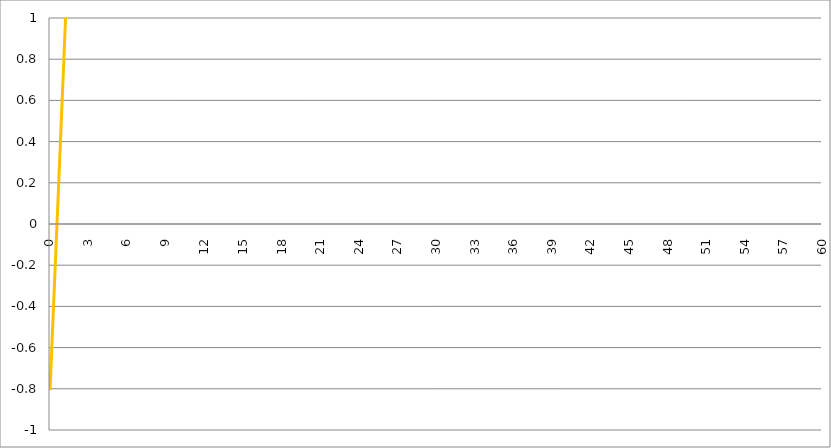
| Category | Series 1 | Series 0 | Series 2 | Series 3 |
|---|---|---|---|---|
| 0.0 |  |  |  | -0.807 |
| 0.03 |  |  |  | -0.763 |
| 0.06 |  |  |  | -0.718 |
| 0.09 |  |  |  | -0.674 |
| 0.12 |  |  |  | -0.629 |
| 0.15 |  |  |  | -0.585 |
| 0.18 |  |  |  | -0.54 |
| 0.21 |  |  |  | -0.496 |
| 0.24 |  |  |  | -0.451 |
| 0.27 |  |  |  | -0.407 |
| 0.3 |  |  |  | -0.362 |
| 0.33 |  |  |  | -0.318 |
| 0.36 |  |  |  | -0.273 |
| 0.39 |  |  |  | -0.229 |
| 0.42 |  |  |  | -0.184 |
| 0.45 |  |  |  | -0.139 |
| 0.48 |  |  |  | -0.095 |
| 0.51 |  |  |  | -0.05 |
| 0.54 |  |  |  | -0.005 |
| 0.57 |  |  |  | 0.039 |
| 0.6 |  |  |  | 0.084 |
| 0.63 |  |  |  | 0.129 |
| 0.66 |  |  |  | 0.174 |
| 0.69 |  |  |  | 0.218 |
| 0.72 |  |  |  | 0.263 |
| 0.75 |  |  |  | 0.308 |
| 0.78 |  |  |  | 0.353 |
| 0.81 |  |  |  | 0.398 |
| 0.84 |  |  |  | 0.443 |
| 0.87 |  |  |  | 0.488 |
| 0.900000000000001 |  |  |  | 0.533 |
| 0.930000000000001 |  |  |  | 0.578 |
| 0.960000000000001 |  |  |  | 0.623 |
| 0.990000000000001 |  |  |  | 0.668 |
| 1.020000000000001 |  |  |  | 0.713 |
| 1.050000000000001 |  |  |  | 0.758 |
| 1.080000000000001 |  |  |  | 0.803 |
| 1.110000000000001 |  |  |  | 0.849 |
| 1.140000000000001 |  |  |  | 0.894 |
| 1.170000000000001 |  |  |  | 0.94 |
| 1.200000000000001 |  |  |  | 0.985 |
| 1.230000000000001 |  |  |  | 1.03 |
| 1.260000000000001 |  |  |  | 1.076 |
| 1.290000000000001 |  |  |  | 1.122 |
| 1.320000000000001 |  |  |  | 1.167 |
| 1.350000000000001 |  |  |  | 1.213 |
| 1.380000000000001 |  |  |  | 1.259 |
| 1.410000000000001 |  |  |  | 1.305 |
| 1.440000000000001 |  |  |  | 1.351 |
| 1.470000000000001 |  |  |  | 1.397 |
| 1.500000000000001 |  |  |  | 1.443 |
| 1.530000000000001 |  |  |  | 1.489 |
| 1.560000000000001 |  |  |  | 1.536 |
| 1.590000000000001 |  |  |  | 1.582 |
| 1.620000000000001 |  |  |  | 1.628 |
| 1.650000000000001 |  |  |  | 1.675 |
| 1.680000000000001 |  |  |  | 1.722 |
| 1.710000000000001 |  |  |  | 1.769 |
| 1.740000000000001 |  |  |  | 1.816 |
| 1.770000000000001 |  |  |  | 1.863 |
| 1.800000000000001 |  |  |  | 1.91 |
| 1.830000000000001 |  |  |  | 1.957 |
| 1.860000000000001 |  |  |  | 2.004 |
| 1.890000000000001 |  |  |  | 2.052 |
| 1.920000000000001 |  |  |  | 2.1 |
| 1.950000000000001 |  |  |  | 2.147 |
| 1.980000000000001 |  |  |  | 2.195 |
| 2.010000000000002 |  |  |  | 2.244 |
| 2.040000000000001 |  |  |  | 2.292 |
| 2.070000000000001 |  |  |  | 2.34 |
| 2.100000000000001 |  |  |  | 2.389 |
| 2.130000000000001 |  |  |  | 2.438 |
| 2.160000000000001 |  |  |  | 2.487 |
| 2.19 |  |  |  | 2.536 |
| 2.22 |  |  |  | 2.585 |
| 2.25 |  |  |  | 2.635 |
| 2.28 |  |  |  | 2.685 |
| 2.31 |  |  |  | 2.735 |
| 2.339999999999999 |  |  |  | 2.785 |
| 2.369999999999999 |  |  |  | 2.835 |
| 2.399999999999999 |  |  |  | 2.886 |
| 2.429999999999999 |  |  |  | 2.937 |
| 2.459999999999999 |  |  |  | 2.988 |
| 2.489999999999998 |  |  |  | 3.04 |
| 2.519999999999998 |  |  |  | 3.091 |
| 2.549999999999998 |  |  |  | 3.144 |
| 2.579999999999998 |  |  |  | 3.196 |
| 2.609999999999998 |  |  |  | 3.249 |
| 2.639999999999997 |  |  |  | 3.302 |
| 2.669999999999997 |  |  |  | 3.355 |
| 2.699999999999997 |  |  |  | 3.408 |
| 2.729999999999997 |  |  |  | 3.462 |
| 2.759999999999997 |  |  |  | 3.517 |
| 2.789999999999996 |  |  |  | 3.572 |
| 2.819999999999996 |  |  |  | 3.627 |
| 2.849999999999996 |  |  |  | 3.682 |
| 2.879999999999996 |  |  |  | 3.738 |
| 2.909999999999996 |  |  |  | 3.794 |
| 2.939999999999995 |  |  |  | 3.851 |
| 2.969999999999995 |  |  |  | 3.908 |
| 2.999999999999995 |  |  |  | 3.966 |
| 3.029999999999995 |  |  |  | 4.024 |
| 3.059999999999995 |  |  |  | 4.083 |
| 3.089999999999995 |  |  |  | 4.142 |
| 3.119999999999994 |  |  |  | 4.202 |
| 3.149999999999994 |  |  |  | 4.262 |
| 3.179999999999994 |  |  |  | 4.323 |
| 3.209999999999994 |  |  |  | 4.385 |
| 3.239999999999994 |  |  |  | 4.447 |
| 3.269999999999993 |  |  |  | 4.509 |
| 3.299999999999993 |  |  |  | 4.573 |
| 3.329999999999993 |  |  |  | 4.637 |
| 3.359999999999993 |  |  |  | 4.701 |
| 3.389999999999993 |  |  |  | 4.767 |
| 3.419999999999992 |  |  |  | 4.833 |
| 3.449999999999992 |  |  |  | 4.899 |
| 3.479999999999992 |  |  |  | 4.967 |
| 3.509999999999992 |  |  |  | 5.036 |
| 3.539999999999992 |  |  |  | 5.105 |
| 3.569999999999991 |  |  |  | 5.175 |
| 3.599999999999991 |  |  |  | 5.246 |
| 3.629999999999991 |  |  |  | 5.318 |
| 3.659999999999991 |  |  |  | 5.39 |
| 3.689999999999991 |  |  |  | 5.464 |
| 3.71999999999999 |  |  |  | 5.539 |
| 3.74999999999999 |  |  |  | 5.615 |
| 3.77999999999999 |  |  |  | 5.691 |
| 3.80999999999999 |  |  |  | 5.769 |
| 3.83999999999999 |  |  |  | 5.848 |
| 3.869999999999989 |  |  |  | 5.929 |
| 3.899999999999989 |  |  |  | 6.01 |
| 3.929999999999989 |  |  |  | 6.092 |
| 3.959999999999989 |  |  |  | 6.176 |
| 3.989999999999989 |  |  |  | 6.261 |
| 4.019999999999989 |  |  |  | 6.348 |
| 4.04999999999999 |  |  |  | 6.436 |
| 4.07999999999999 |  |  |  | 6.525 |
| 4.10999999999999 |  |  |  | 6.616 |
| 4.13999999999999 |  |  |  | 6.708 |
| 4.16999999999999 |  |  |  | 6.802 |
| 4.19999999999999 |  |  |  | 6.897 |
| 4.229999999999991 |  |  |  | 6.994 |
| 4.259999999999991 |  |  |  | 7.093 |
| 4.289999999999991 |  |  |  | 7.193 |
| 4.319999999999991 |  |  |  | 7.296 |
| 4.349999999999992 |  |  |  | 7.4 |
| 4.379999999999992 |  |  |  | 7.506 |
| 4.409999999999992 |  |  |  | 7.614 |
| 4.439999999999992 |  |  |  | 7.724 |
| 4.469999999999993 |  |  |  | 7.836 |
| 4.499999999999993 |  |  |  | 7.95 |
| 4.529999999999993 |  |  |  | 8.067 |
| 4.559999999999993 |  |  |  | 8.186 |
| 4.589999999999994 |  |  |  | 8.307 |
| 4.619999999999994 |  |  |  | 8.43 |
| 4.649999999999994 |  |  |  | 8.556 |
| 4.679999999999994 |  |  |  | 8.685 |
| 4.709999999999994 |  |  |  | 8.816 |
| 4.739999999999994 |  |  |  | 8.95 |
| 4.769999999999995 |  |  |  | 9.087 |
| 4.799999999999995 |  |  |  | 9.226 |
| 4.829999999999996 |  |  |  | 9.369 |
| 4.859999999999996 |  |  |  | 9.514 |
| 4.889999999999996 |  |  |  | 9.663 |
| 4.919999999999996 |  |  |  | 9.815 |
| 4.949999999999996 |  |  |  | 9.97 |
| 4.979999999999996 |  |  |  | 10.129 |
| 5.009999999999997 |  |  |  | 10.291 |
| 5.039999999999997 |  |  |  | 10.457 |
| 5.069999999999998 |  |  |  | 10.627 |
| 5.099999999999998 |  |  |  | 10.8 |
| 5.129999999999998 |  |  |  | 10.977 |
| 5.159999999999998 |  |  |  | 11.159 |
| 5.189999999999999 |  |  |  | 11.344 |
| 5.219999999999999 |  |  |  | 11.534 |
| 5.25 |  |  |  | 11.728 |
| 5.28 |  |  |  | 11.927 |
| 5.31 |  |  |  | 12.131 |
| 5.34 |  |  |  | 12.339 |
| 5.37 |  |  |  | 12.552 |
| 5.4 |  |  |  | 12.771 |
| 5.43 |  |  |  | 12.994 |
| 5.460000000000001 |  |  |  | 13.223 |
| 5.490000000000001 |  |  |  | 13.458 |
| 5.520000000000001 |  |  |  | 13.698 |
| 5.550000000000002 |  |  |  | 13.944 |
| 5.580000000000002 |  |  |  | 14.196 |
| 5.610000000000002 |  |  |  | 14.455 |
| 5.640000000000002 |  |  |  | 14.719 |
| 5.670000000000002 |  |  |  | 14.991 |
| 5.700000000000003 |  |  |  | 15.269 |
| 5.730000000000003 |  |  |  | 15.554 |
| 5.760000000000003 |  |  |  | 15.846 |
| 5.790000000000003 |  |  |  | 16.145 |
| 5.820000000000004 |  |  |  | 16.452 |
| 5.850000000000004 |  |  |  | 16.767 |
| 5.880000000000004 |  |  |  | 17.09 |
| 5.910000000000004 |  |  |  | 17.421 |
| 5.940000000000004 |  |  |  | 17.76 |
| 5.970000000000005 |  |  |  | 18.108 |
| 6.000000000000005 |  |  |  | 18.466 |
| 6.030000000000005 |  |  |  | 18.832 |
| 6.060000000000006 |  |  |  | 19.207 |
| 6.090000000000006 |  |  |  | 19.593 |
| 6.120000000000006 |  |  |  | 19.988 |
| 6.150000000000007 |  |  |  | 20.394 |
| 6.180000000000007 |  |  |  | 20.81 |
| 6.210000000000007 |  |  |  | 21.237 |
| 6.240000000000007 |  |  |  | 21.675 |
| 6.270000000000007 |  |  |  | 22.125 |
| 6.300000000000008 |  |  |  | 22.586 |
| 6.330000000000008 |  |  |  | 23.06 |
| 6.360000000000008 |  |  |  | 23.546 |
| 6.390000000000008 |  |  |  | 24.045 |
| 6.420000000000009 |  |  |  | 24.556 |
| 6.45000000000001 |  |  |  | 25.082 |
| 6.48000000000001 |  |  |  | 25.621 |
| 6.51000000000001 |  |  |  | 26.175 |
| 6.54000000000001 |  |  |  | 26.743 |
| 6.57000000000001 |  |  |  | 27.327 |
| 6.60000000000001 |  |  |  | 27.926 |
| 6.63000000000001 |  |  |  | 28.541 |
| 6.660000000000011 |  |  |  | 29.172 |
| 6.690000000000011 |  |  |  | 29.82 |
| 6.720000000000011 |  |  |  | 30.485 |
| 6.750000000000011 |  |  |  | 31.169 |
| 6.780000000000012 |  |  |  | 31.87 |
| 6.810000000000012 |  |  |  | 32.591 |
| 6.840000000000012 |  |  |  | 33.33 |
| 6.870000000000012 |  |  |  | 34.09 |
| 6.900000000000013 |  |  |  | 34.87 |
| 6.930000000000013 |  |  |  | 35.67 |
| 6.960000000000013 |  |  |  | 36.493 |
| 6.990000000000013 |  |  |  | 37.337 |
| 7.020000000000014 |  |  |  | 38.204 |
| 7.050000000000014 |  |  |  | 39.095 |
| 7.080000000000014 |  |  |  | 40.01 |
| 7.110000000000015 |  |  |  | 40.949 |
| 7.140000000000015 |  |  |  | 41.914 |
| 7.170000000000015 |  |  |  | 42.904 |
| 7.200000000000015 |  |  |  | 43.922 |
| 7.230000000000015 |  |  |  | 44.967 |
| 7.260000000000016 |  |  |  | 46.04 |
| 7.290000000000016 |  |  |  | 47.142 |
| 7.320000000000016 |  |  |  | 48.274 |
| 7.350000000000016 |  |  |  | 49.437 |
| 7.380000000000017 |  |  |  | 50.631 |
| 7.410000000000017 |  |  |  | 51.858 |
| 7.440000000000017 |  |  |  | 53.117 |
| 7.470000000000017 |  |  |  | 54.411 |
| 7.500000000000018 |  |  |  | 55.74 |
| 7.530000000000018 |  |  |  | 57.105 |
| 7.560000000000018 |  |  |  | 58.507 |
| 7.590000000000018 |  |  |  | 59.947 |
| 7.620000000000019 |  |  |  | 61.426 |
| 7.650000000000019 |  |  |  | 62.945 |
| 7.680000000000019 |  |  |  | 64.505 |
| 7.710000000000019 |  |  |  | 66.108 |
| 7.74000000000002 |  |  |  | 67.754 |
| 7.77000000000002 |  |  |  | 69.445 |
| 7.80000000000002 |  |  |  | 71.181 |
| 7.83000000000002 |  |  |  | 72.965 |
| 7.860000000000021 |  |  |  | 74.797 |
| 7.890000000000021 |  |  |  | 76.679 |
| 7.920000000000021 |  |  |  | 78.612 |
| 7.950000000000021 |  |  |  | 80.597 |
| 7.980000000000021 |  |  |  | 82.636 |
| 8.010000000000021 |  |  |  | 84.731 |
| 8.04000000000002 |  |  |  | 86.882 |
| 8.07000000000002 |  |  |  | 89.092 |
| 8.10000000000002 |  |  |  | 91.362 |
| 8.130000000000019 |  |  |  | 93.693 |
| 8.160000000000016 |  |  |  | 96.087 |
| 8.190000000000017 |  |  |  | 98.546 |
| 8.220000000000017 |  |  |  | 101.072 |
| 8.250000000000014 |  |  |  | 103.667 |
| 8.280000000000015 |  |  |  | 106.331 |
| 8.310000000000015 |  |  |  | 109.068 |
| 8.340000000000014 |  |  |  | 111.879 |
| 8.370000000000013 |  |  |  | 114.767 |
| 8.400000000000013 |  |  |  | 117.732 |
| 8.430000000000012 |  |  |  | 120.778 |
| 8.46000000000001 |  |  |  | 123.906 |
| 8.49000000000001 |  |  |  | 127.119 |
| 8.52000000000001 |  |  |  | 130.418 |
| 8.55000000000001 |  |  |  | 133.807 |
| 8.580000000000007 |  |  |  | 137.288 |
| 8.610000000000008 |  |  |  | 140.863 |
| 8.640000000000008 |  |  |  | 144.535 |
| 8.670000000000007 |  |  |  | 148.305 |
| 8.700000000000006 |  |  |  | 152.178 |
| 8.730000000000006 |  |  |  | 156.155 |
| 8.760000000000005 |  |  |  | 160.24 |
| 8.790000000000004 |  |  |  | 164.435 |
| 8.820000000000004 |  |  |  | 168.744 |
| 8.850000000000003 |  |  |  | 173.168 |
| 8.880000000000003 |  |  |  | 177.712 |
| 8.91 |  |  |  | 182.379 |
| 8.940000000000001 |  |  |  | 187.172 |
| 8.97 |  |  |  | 192.093 |
| 9.0 |  |  |  | 197.148 |
| 9.03 |  |  |  | 202.338 |
| 9.059999999999999 |  |  |  | 207.669 |
| 9.089999999999998 |  |  |  | 213.143 |
| 9.119999999999997 |  |  |  | 218.765 |
| 9.149999999999997 |  |  |  | 224.537 |
| 9.179999999999996 |  |  |  | 230.466 |
| 9.209999999999996 |  |  |  | 236.553 |
| 9.239999999999995 |  |  |  | 242.805 |
| 9.269999999999994 |  |  |  | 249.224 |
| 9.299999999999994 |  |  |  | 255.816 |
| 9.32999999999999 |  |  |  | 262.585 |
| 9.35999999999999 |  |  |  | 269.536 |
| 9.38999999999999 |  |  |  | 276.674 |
| 9.41999999999999 |  |  |  | 284.003 |
| 9.44999999999999 |  |  |  | 291.53 |
| 9.47999999999999 |  |  |  | 299.258 |
| 9.50999999999999 |  |  |  | 307.193 |
| 9.539999999999988 |  |  |  | 315.341 |
| 9.569999999999988 |  |  |  | 323.707 |
| 9.599999999999987 |  |  |  | 332.298 |
| 9.629999999999987 |  |  |  | 341.119 |
| 9.659999999999984 |  |  |  | 350.176 |
| 9.689999999999985 |  |  |  | 359.476 |
| 9.719999999999985 |  |  |  | 369.024 |
| 9.749999999999982 |  |  |  | 378.828 |
| 9.779999999999983 |  |  |  | 388.894 |
| 9.80999999999998 |  |  |  | 399.229 |
| 9.83999999999998 |  |  |  | 409.841 |
| 9.86999999999998 |  |  |  | 420.736 |
| 9.89999999999998 |  |  |  | 431.922 |
| 9.92999999999998 |  |  |  | 443.407 |
| 9.95999999999998 |  |  |  | 455.199 |
| 9.989999999999977 |  |  |  | 467.305 |
| 10.01999999999998 |  |  |  | 479.734 |
| 10.04999999999998 |  |  |  | 492.495 |
| 10.07999999999998 |  |  |  | 505.596 |
| 10.10999999999998 |  |  |  | 519.046 |
| 10.13999999999998 |  |  |  | 532.855 |
| 10.16999999999998 |  |  |  | 547.031 |
| 10.19999999999997 |  |  |  | 561.585 |
| 10.22999999999997 |  |  |  | 576.526 |
| 10.25999999999997 |  |  |  | 591.865 |
| 10.28999999999997 |  |  |  | 607.612 |
| 10.31999999999997 |  |  |  | 623.778 |
| 10.34999999999997 |  |  |  | 640.373 |
| 10.37999999999997 |  |  |  | 657.41 |
| 10.40999999999997 |  |  |  | 674.899 |
| 10.43999999999997 |  |  |  | 692.853 |
| 10.46999999999997 |  |  |  | 711.284 |
| 10.49999999999997 |  |  |  | 730.203 |
| 10.52999999999997 |  |  |  | 749.625 |
| 10.55999999999997 |  |  |  | 769.562 |
| 10.58999999999997 |  |  |  | 790.028 |
| 10.61999999999997 |  |  |  | 811.037 |
| 10.64999999999996 |  |  |  | 832.602 |
| 10.67999999999996 |  |  |  | 854.738 |
| 10.70999999999996 |  |  |  | 877.461 |
| 10.73999999999996 |  |  |  | 900.786 |
| 10.76999999999996 |  |  |  | 924.728 |
| 10.79999999999996 |  |  |  | 949.303 |
| 10.82999999999996 |  |  |  | 974.529 |
| 10.85999999999996 |  |  |  | 1000.422 |
| 10.88999999999996 |  |  |  | 1026.999 |
| 10.91999999999996 |  |  |  | 1054.279 |
| 10.94999999999996 |  |  |  | 1082.279 |
| 10.97999999999996 |  |  |  | 1111.019 |
| 11.00999999999996 |  |  |  | 1140.519 |
| 11.03999999999996 |  |  |  | 1170.796 |
| 11.06999999999996 |  |  |  | 1201.873 |
| 11.09999999999996 |  |  |  | 1233.77 |
| 11.12999999999995 |  |  |  | 1266.508 |
| 11.15999999999995 |  |  |  | 1300.109 |
| 11.18999999999995 |  |  |  | 1334.596 |
| 11.21999999999995 |  |  |  | 1369.991 |
| 11.24999999999995 |  |  |  | 1406.319 |
| 11.27999999999995 |  |  |  | 1443.604 |
| 11.30999999999995 |  |  |  | 1481.87 |
| 11.33999999999995 |  |  |  | 1521.144 |
| 11.36999999999995 |  |  |  | 1561.451 |
| 11.39999999999995 |  |  |  | 1602.818 |
| 11.42999999999995 |  |  |  | 1645.273 |
| 11.45999999999995 |  |  |  | 1688.844 |
| 11.48999999999995 |  |  |  | 1733.56 |
| 11.51999999999995 |  |  |  | 1779.451 |
| 11.54999999999995 |  |  |  | 1826.547 |
| 11.57999999999994 |  |  |  | 1874.88 |
| 11.60999999999994 |  |  |  | 1924.482 |
| 11.63999999999994 |  |  |  | 1975.386 |
| 11.66999999999994 |  |  |  | 2027.625 |
| 11.69999999999994 |  |  |  | 2081.235 |
| 11.72999999999994 |  |  |  | 2136.25 |
| 11.75999999999994 |  |  |  | 2192.707 |
| 11.78999999999994 |  |  |  | 2250.644 |
| 11.81999999999994 |  |  |  | 2310.099 |
| 11.84999999999994 |  |  |  | 2371.112 |
| 11.87999999999994 |  |  |  | 2433.722 |
| 11.90999999999994 |  |  |  | 2497.971 |
| 11.93999999999994 |  |  |  | 2563.901 |
| 11.96999999999994 |  |  |  | 2631.557 |
| 11.99999999999994 |  |  |  | 2700.982 |
| 12.02999999999994 |  |  |  | 2772.223 |
| 12.05999999999993 |  |  |  | 2845.326 |
| 12.08999999999993 |  |  |  | 2920.34 |
| 12.11999999999993 |  |  |  | 2997.314 |
| 12.14999999999993 |  |  |  | 3076.299 |
| 12.17999999999993 |  |  |  | 3157.346 |
| 12.20999999999993 |  |  |  | 3240.51 |
| 12.23999999999993 |  |  |  | 3325.844 |
| 12.26999999999993 |  |  |  | 3413.405 |
| 12.29999999999993 |  |  |  | 3503.251 |
| 12.32999999999993 |  |  |  | 3595.439 |
| 12.35999999999993 |  |  |  | 3690.032 |
| 12.38999999999993 |  |  |  | 3787.09 |
| 12.41999999999993 |  |  |  | 3886.678 |
| 12.44999999999993 |  |  |  | 3988.86 |
| 12.47999999999993 |  |  |  | 4093.705 |
| 12.50999999999993 |  |  |  | 4201.279 |
| 12.53999999999992 |  |  |  | 4311.654 |
| 12.56999999999992 |  |  |  | 4424.902 |
| 12.59999999999992 |  |  |  | 4541.097 |
| 12.62999999999992 |  |  |  | 4660.315 |
| 12.65999999999992 |  |  |  | 4782.634 |
| 12.68999999999992 |  |  |  | 4908.133 |
| 12.71999999999992 |  |  |  | 5036.895 |
| 12.74999999999992 |  |  |  | 5169.003 |
| 12.77999999999992 |  |  |  | 5304.543 |
| 12.80999999999992 |  |  |  | 5443.605 |
| 12.83999999999992 |  |  |  | 5586.278 |
| 12.86999999999992 |  |  |  | 5732.656 |
| 12.89999999999992 |  |  |  | 5882.833 |
| 12.92999999999992 |  |  |  | 6036.908 |
| 12.95999999999992 |  |  |  | 6194.981 |
| 12.98999999999991 |  |  |  | 6357.153 |
| 13.01999999999991 |  |  |  | 6523.532 |
| 13.04999999999991 |  |  |  | 6694.224 |
| 13.07999999999991 |  |  |  | 6869.341 |
| 13.10999999999991 |  |  |  | 7048.996 |
| 13.13999999999991 |  |  |  | 7233.306 |
| 13.16999999999991 |  |  |  | 7422.39 |
| 13.19999999999991 |  |  |  | 7616.371 |
| 13.22999999999991 |  |  |  | 7815.374 |
| 13.25999999999991 |  |  |  | 8019.529 |
| 13.28999999999991 |  |  |  | 8228.967 |
| 13.31999999999991 |  |  |  | 8443.824 |
| 13.34999999999991 |  |  |  | 8664.238 |
| 13.37999999999991 |  |  |  | 8890.354 |
| 13.40999999999991 |  |  |  | 9122.315 |
| 13.43999999999991 |  |  |  | 9360.273 |
| 13.4699999999999 |  |  |  | 9604.381 |
| 13.4999999999999 |  |  |  | 9854.797 |
| 13.5299999999999 |  |  |  | 10111.682 |
| 13.5599999999999 |  |  |  | 10375.201 |
| 13.5899999999999 |  |  |  | 10645.525 |
| 13.6199999999999 |  |  |  | 10922.828 |
| 13.6499999999999 |  |  |  | 11207.288 |
| 13.6799999999999 |  |  |  | 11499.088 |
| 13.7099999999999 |  |  |  | 11798.417 |
| 13.7399999999999 |  |  |  | 12105.467 |
| 13.7699999999999 |  |  |  | 12420.436 |
| 13.7999999999999 |  |  |  | 12743.525 |
| 13.8299999999999 |  |  |  | 13074.943 |
| 13.8599999999999 |  |  |  | 13414.902 |
| 13.8899999999999 |  |  |  | 13763.621 |
| 13.9199999999999 |  |  |  | 14121.323 |
| 13.94999999999989 |  |  |  | 14488.239 |
| 13.97999999999989 |  |  |  | 14864.602 |
| 14.00999999999989 |  |  |  | 15250.656 |
| 14.03999999999989 |  |  |  | 15646.646 |
| 14.0699999999999 |  |  |  | 16052.827 |
| 14.0999999999999 |  |  |  | 16469.459 |
| 14.1299999999999 |  |  |  | 16896.809 |
| 14.15999999999989 |  |  |  | 17335.15 |
| 14.18999999999989 |  |  |  | 17784.762 |
| 14.21999999999989 |  |  |  | 18245.934 |
| 14.24999999999989 |  |  |  | 18718.959 |
| 14.27999999999989 |  |  |  | 19204.14 |
| 14.30999999999989 |  |  |  | 19701.787 |
| 14.33999999999989 |  |  |  | 20212.218 |
| 14.36999999999989 |  |  |  | 20735.759 |
| 14.39999999999988 |  |  |  | 21272.743 |
| 14.42999999999988 |  |  |  | 21823.514 |
| 14.45999999999988 |  |  |  | 22388.422 |
| 14.48999999999988 |  |  |  | 22967.827 |
| 14.51999999999988 |  |  |  | 23562.099 |
| 14.54999999999988 |  |  |  | 24171.616 |
| 14.57999999999988 |  |  |  | 24796.766 |
| 14.60999999999988 |  |  |  | 25437.948 |
| 14.63999999999988 |  |  |  | 26095.569 |
| 14.66999999999988 |  |  |  | 26770.047 |
| 14.69999999999988 |  |  |  | 27461.811 |
| 14.72999999999988 |  |  |  | 28171.301 |
| 14.75999999999988 |  |  |  | 28898.969 |
| 14.78999999999988 |  |  |  | 29645.275 |
| 14.81999999999988 |  |  |  | 30410.694 |
| 14.84999999999988 |  |  |  | 31195.713 |
| 14.87999999999987 |  |  |  | 32000.828 |
| 14.90999999999987 |  |  |  | 32826.551 |
| 14.93999999999987 |  |  |  | 33673.405 |
| 14.96999999999987 |  |  |  | 34541.927 |
| 14.99999999999987 |  |  |  | 35432.668 |
| 15.02999999999987 |  |  |  | 36346.191 |
| 15.05999999999987 |  |  |  | 37283.076 |
| 15.08999999999987 |  |  |  | 38243.916 |
| 15.11999999999987 |  |  |  | 39229.318 |
| 15.14999999999987 |  |  |  | 40239.906 |
| 15.17999999999987 |  |  |  | 41276.319 |
| 15.20999999999987 |  |  |  | 42339.213 |
| 15.23999999999987 |  |  |  | 43429.259 |
| 15.26999999999987 |  |  |  | 44547.146 |
| 15.29999999999987 |  |  |  | 45693.581 |
| 15.32999999999987 |  |  |  | 46869.286 |
| 15.35999999999986 |  |  |  | 48075.005 |
| 15.38999999999986 |  |  |  | 49311.498 |
| 15.41999999999986 |  |  |  | 50579.545 |
| 15.44999999999986 |  |  |  | 51879.946 |
| 15.47999999999986 |  |  |  | 53213.521 |
| 15.50999999999986 |  |  |  | 54581.11 |
| 15.53999999999986 |  |  |  | 55983.575 |
| 15.56999999999986 |  |  |  | 57421.8 |
| 15.59999999999986 |  |  |  | 58896.69 |
| 15.62999999999986 |  |  |  | 60409.173 |
| 15.65999999999986 |  |  |  | 61960.201 |
| 15.68999999999986 |  |  |  | 63550.751 |
| 15.71999999999986 |  |  |  | 65181.822 |
| 15.74999999999986 |  |  |  | 66854.44 |
| 15.77999999999986 |  |  |  | 68569.656 |
| 15.80999999999985 |  |  |  | 70328.548 |
| 15.83999999999985 |  |  |  | 72132.221 |
| 15.86999999999985 |  |  |  | 73981.807 |
| 15.89999999999985 |  |  |  | 75878.469 |
| 15.92999999999985 |  |  |  | 77823.395 |
| 15.95999999999985 |  |  |  | 79817.807 |
| 15.98999999999985 |  |  |  | 81862.955 |
| 16.01999999999985 |  |  |  | 83960.122 |
| 16.04999999999985 |  |  |  | 86110.623 |
| 16.07999999999985 |  |  |  | 88315.804 |
| 16.10999999999985 |  |  |  | 90577.049 |
| 16.13999999999985 |  |  |  | 92895.773 |
| 16.16999999999986 |  |  |  | 95273.427 |
| 16.19999999999986 |  |  |  | 97711.501 |
| 16.22999999999986 |  |  |  | 100211.52 |
| 16.25999999999986 |  |  |  | 102775.049 |
| 16.28999999999986 |  |  |  | 105403.689 |
| 16.31999999999986 |  |  |  | 108099.086 |
| 16.34999999999986 |  |  |  | 110862.924 |
| 16.37999999999986 |  |  |  | 113696.931 |
| 16.40999999999987 |  |  |  | 116602.876 |
| 16.43999999999987 |  |  |  | 119582.574 |
| 16.46999999999987 |  |  |  | 122637.887 |
| 16.49999999999987 |  |  |  | 125770.722 |
| 16.52999999999987 |  |  |  | 128983.033 |
| 16.55999999999987 |  |  |  | 132276.824 |
| 16.58999999999987 |  |  |  | 135654.151 |
| 16.61999999999987 |  |  |  | 139117.119 |
| 16.64999999999987 |  |  |  | 142667.887 |
| 16.67999999999988 |  |  |  | 146308.667 |
| 16.70999999999988 |  |  |  | 150041.728 |
| 16.73999999999988 |  |  |  | 153869.396 |
| 16.76999999999988 |  |  |  | 157794.053 |
| 16.79999999999988 |  |  |  | 161818.144 |
| 16.82999999999988 |  |  |  | 165944.172 |
| 16.85999999999988 |  |  |  | 170174.705 |
| 16.88999999999988 |  |  |  | 174512.374 |
| 16.91999999999988 |  |  |  | 178959.878 |
| 16.94999999999989 |  |  |  | 183519.981 |
| 16.97999999999989 |  |  |  | 188195.517 |
| 17.00999999999989 |  |  |  | 192989.393 |
| 17.03999999999989 |  |  |  | 197904.585 |
| 17.06999999999989 |  |  |  | 202944.148 |
| 17.09999999999989 |  |  |  | 208111.21 |
| 17.12999999999989 |  |  |  | 213408.978 |
| 17.15999999999989 |  |  |  | 218840.742 |
| 17.18999999999989 |  |  |  | 224409.869 |
| 17.2199999999999 |  |  |  | 230119.816 |
| 17.2499999999999 |  |  |  | 235974.123 |
| 17.2799999999999 |  |  |  | 241976.42 |
| 17.3099999999999 |  |  |  | 248130.427 |
| 17.3399999999999 |  |  |  | 254439.957 |
| 17.3699999999999 |  |  |  | 260908.92 |
| 17.3999999999999 |  |  |  | 267541.321 |
| 17.4299999999999 |  |  |  | 274341.269 |
| 17.4599999999999 |  |  |  | 281312.972 |
| 17.48999999999991 |  |  |  | 288460.745 |
| 17.51999999999991 |  |  |  | 295789.012 |
| 17.54999999999991 |  |  |  | 303302.304 |
| 17.57999999999991 |  |  |  | 311005.269 |
| 17.60999999999991 |  |  |  | 318902.67 |
| 17.63999999999991 |  |  |  | 326999.389 |
| 17.66999999999991 |  |  |  | 335300.428 |
| 17.69999999999991 |  |  |  | 343810.918 |
| 17.72999999999992 |  |  |  | 352536.115 |
| 17.75999999999992 |  |  |  | 361481.407 |
| 17.78999999999992 |  |  |  | 370652.318 |
| 17.81999999999992 |  |  |  | 380054.507 |
| 17.84999999999992 |  |  |  | 389693.779 |
| 17.87999999999992 |  |  |  | 399576.079 |
| 17.90999999999992 |  |  |  | 409707.504 |
| 17.93999999999992 |  |  |  | 420094.301 |
| 17.96999999999992 |  |  |  | 430742.875 |
| 17.99999999999993 |  |  |  | 441659.789 |
| 18.02999999999993 |  |  |  | 452851.77 |
| 18.05999999999993 |  |  |  | 464325.715 |
| 18.08999999999993 |  |  |  | 476088.692 |
| 18.11999999999993 |  |  |  | 488147.943 |
| 18.14999999999993 |  |  |  | 500510.894 |
| 18.17999999999993 |  |  |  | 513185.155 |
| 18.20999999999993 |  |  |  | 526178.527 |
| 18.23999999999993 |  |  |  | 539499.002 |
| 18.26999999999994 |  |  |  | 553154.776 |
| 18.29999999999994 |  |  |  | 567154.246 |
| 18.32999999999994 |  |  |  | 581506.021 |
| 18.35999999999994 |  |  |  | 596218.922 |
| 18.38999999999994 |  |  |  | 611301.993 |
| 18.41999999999994 |  |  |  | 626764.5 |
| 18.44999999999994 |  |  |  | 642615.943 |
| 18.47999999999994 |  |  |  | 658866.057 |
| 18.50999999999994 |  |  |  | 675524.82 |
| 18.53999999999995 |  |  |  | 692602.46 |
| 18.56999999999995 |  |  |  | 710109.458 |
| 18.59999999999995 |  |  |  | 728056.558 |
| 18.62999999999995 |  |  |  | 746454.769 |
| 18.65999999999995 |  |  |  | 765315.378 |
| 18.68999999999995 |  |  |  | 784649.95 |
| 18.71999999999995 |  |  |  | 804470.339 |
| 18.74999999999995 |  |  |  | 824788.695 |
| 18.77999999999995 |  |  |  | 845617.47 |
| 18.80999999999996 |  |  |  | 866969.426 |
| 18.83999999999996 |  |  |  | 888857.643 |
| 18.86999999999996 |  |  |  | 911295.527 |
| 18.89999999999996 |  |  |  | 934296.818 |
| 18.92999999999996 |  |  |  | 957875.595 |
| 18.95999999999996 |  |  |  | 982046.293 |
| 18.98999999999996 |  |  |  | 1006823.701 |
| 19.01999999999996 |  |  |  | 1032222.979 |
| 19.04999999999997 |  |  |  | 1058259.663 |
| 19.07999999999997 |  |  |  | 1084949.677 |
| 19.10999999999997 |  |  |  | 1112309.34 |
| 19.13999999999997 |  |  |  | 1140355.376 |
| 19.16999999999997 |  |  |  | 1169104.929 |
| 19.19999999999997 |  |  |  | 1198575.564 |
| 19.22999999999997 |  |  |  | 1228785.287 |
| 19.25999999999997 |  |  |  | 1259752.551 |
| 19.28999999999997 |  |  |  | 1291496.267 |
| 19.31999999999998 |  |  |  | 1324035.816 |
| 19.34999999999998 |  |  |  | 1357391.061 |
| 19.37999999999998 |  |  |  | 1391582.362 |
| 19.40999999999998 |  |  |  | 1426630.58 |
| 19.43999999999998 |  |  |  | 1462557.097 |
| 19.46999999999998 |  |  |  | 1499383.829 |
| 19.49999999999998 |  |  |  | 1537133.232 |
| 19.52999999999998 |  |  |  | 1575828.323 |
| 19.55999999999998 |  |  |  | 1615492.69 |
| 19.58999999999999 |  |  |  | 1656150.508 |
| 19.61999999999999 |  |  |  | 1697826.552 |
| 19.64999999999999 |  |  |  | 1740546.212 |
| 19.67999999999999 |  |  |  | 1784335.51 |
| 19.70999999999999 |  |  |  | 1829221.112 |
| 19.73999999999999 |  |  |  | 1875230.35 |
| 19.76999999999999 |  |  |  | 1922391.231 |
| 19.79999999999999 |  |  |  | 1970732.461 |
| 19.82999999999999 |  |  |  | 2020283.455 |
| 19.86 |  |  |  | 2071074.363 |
| 19.89 |  |  |  | 2123136.078 |
| 19.92 |  |  |  | 2176500.266 |
| 19.95 |  |  |  | 2231199.373 |
| 19.98 |  |  |  | 2287266.656 |
| 20.01 |  |  |  | 2344736.193 |
| 20.04 |  |  |  | 2403642.91 |
| 20.07 |  |  |  | 2464022.599 |
| 20.1 |  |  |  | 2525911.941 |
| 20.13000000000001 |  |  |  | 2589348.526 |
| 20.16000000000001 |  |  |  | 2654370.877 |
| 20.19000000000001 |  |  |  | 2721018.472 |
| 20.22000000000001 |  |  |  | 2789331.771 |
| 20.25000000000001 |  |  |  | 2859352.234 |
| 20.28000000000001 |  |  |  | 2931122.352 |
| 20.31000000000001 |  |  |  | 3004685.667 |
| 20.34000000000001 |  |  |  | 3080086.804 |
| 20.37000000000002 |  |  |  | 3157371.492 |
| 20.40000000000002 |  |  |  | 3236586.595 |
| 20.43000000000002 |  |  |  | 3317780.14 |
| 20.46000000000002 |  |  |  | 3401001.341 |
| 20.49000000000002 |  |  |  | 3486300.636 |
| 20.52000000000002 |  |  |  | 3573729.711 |
| 20.55000000000002 |  |  |  | 3663341.533 |
| 20.58000000000002 |  |  |  | 3755190.383 |
| 20.61000000000002 |  |  |  | 3849331.886 |
| 20.64000000000003 |  |  |  | 3945823.045 |
| 20.67000000000003 |  |  |  | 4044722.277 |
| 20.70000000000003 |  |  |  | 4146089.446 |
| 20.73000000000003 |  |  |  | 4249985.897 |
| 20.76000000000003 |  |  |  | 4356474.497 |
| 20.79000000000003 |  |  |  | 4465619.668 |
| 20.82000000000003 |  |  |  | 4577487.431 |
| 20.85000000000003 |  |  |  | 4692145.44 |
| 20.88000000000003 |  |  |  | 4809663.023 |
| 20.91000000000004 |  |  |  | 4930111.227 |
| 20.94000000000004 |  |  |  | 5053562.858 |
| 20.97000000000004 |  |  |  | 5180092.523 |
| 21.00000000000004 |  |  |  | 5309776.678 |
| 21.03000000000004 |  |  |  | 5442693.672 |
| 21.06000000000004 |  |  |  | 5578923.79 |
| 21.09000000000004 |  |  |  | 5718549.308 |
| 21.12000000000004 |  |  |  | 5861654.538 |
| 21.15000000000004 |  |  |  | 6008325.875 |
| 21.18000000000005 |  |  |  | 6158651.857 |
| 21.21000000000005 |  |  |  | 6312723.209 |
| 21.24000000000005 |  |  |  | 6470632.903 |
| 21.27000000000005 |  |  |  | 6632476.21 |
| 21.30000000000005 |  |  |  | 6798350.759 |
| 21.33000000000005 |  |  |  | 6968356.593 |
| 21.36000000000005 |  |  |  | 7142596.232 |
| 21.39000000000005 |  |  |  | 7321174.728 |
| 21.42000000000005 |  |  |  | 7504199.735 |
| 21.45000000000006 |  |  |  | 7691781.568 |
| 21.48000000000006 |  |  |  | 7884033.268 |
| 21.51000000000006 |  |  |  | 8081070.675 |
| 21.54000000000006 |  |  |  | 8283012.49 |
| 21.57000000000006 |  |  |  | 8489980.35 |
| 21.60000000000006 |  |  |  | 8702098.901 |
| 21.63000000000006 |  |  |  | 8919495.867 |
| 21.66000000000006 |  |  |  | 9142302.131 |
| 21.69000000000007 |  |  |  | 9370651.811 |
| 21.72000000000007 |  |  |  | 9604682.34 |
| 21.75000000000007 |  |  |  | 9844534.547 |
| 21.78000000000007 |  |  |  | 10090352.742 |
| 21.81000000000007 |  |  |  | 10342284.8 |
| 21.84000000000007 |  |  |  | 10600482.25 |
| 21.87000000000007 |  |  |  | 10865100.365 |
| 21.90000000000007 |  |  |  | 11136298.256 |
| 21.93000000000007 |  |  |  | 11414238.961 |
| 21.96000000000008 |  |  |  | 11699089.548 |
| 21.99000000000008 |  |  |  | 11991021.211 |
| 22.02000000000008 |  |  |  | 12290209.373 |
| 22.05000000000008 |  |  |  | 12596833.789 |
| 22.08000000000008 |  |  |  | 12911078.652 |
| 22.11000000000008 |  |  |  | 13233132.705 |
| 22.14000000000008 |  |  |  | 13563189.351 |
| 22.17000000000008 |  |  |  | 13901446.768 |
| 22.20000000000008 |  |  |  | 14248108.028 |
| 22.23000000000009 |  |  |  | 14603381.216 |
| 22.26000000000009 |  |  |  | 14967479.552 |
| 22.29000000000009 |  |  |  | 15340621.521 |
| 22.32000000000009 |  |  |  | 15723031 |
| 22.3500000000001 |  |  |  | 16114937.394 |
| 22.38000000000009 |  |  |  | 16516575.765 |
| 22.41000000000009 |  |  |  | 16928186.979 |
| 22.44000000000009 |  |  |  | 17350017.846 |
| 22.47000000000009 |  |  |  | 17782321.264 |
| 22.5000000000001 |  |  |  | 18225356.373 |
| 22.5300000000001 |  |  |  | 18679388.704 |
| 22.5600000000001 |  |  |  | 19144690.341 |
| 22.5900000000001 |  |  |  | 19621540.078 |
| 22.6200000000001 |  |  |  | 20110223.587 |
| 22.6500000000001 |  |  |  | 20611033.586 |
| 22.6800000000001 |  |  |  | 21124270.013 |
| 22.7100000000001 |  |  |  | 21650240.203 |
| 22.7400000000001 |  |  |  | 22189259.068 |
| 22.77000000000011 |  |  |  | 22741649.289 |
| 22.80000000000011 |  |  |  | 23307741.501 |
| 22.83000000000011 |  |  |  | 23887874.492 |
| 22.86000000000011 |  |  |  | 24482395.403 |
| 22.89000000000011 |  |  |  | 25091659.931 |
| 22.92000000000011 |  |  |  | 25716032.545 |
| 22.95000000000011 |  |  |  | 26355886.695 |
| 22.98000000000011 |  |  |  | 27011605.038 |
| 23.01000000000012 |  |  |  | 27683579.66 |
| 23.04000000000012 |  |  |  | 28372212.313 |
| 23.07000000000012 |  |  |  | 29077914.647 |
| 23.10000000000012 |  |  |  | 29801108.458 |
| 23.13000000000012 |  |  |  | 30542225.935 |
| 23.16000000000012 |  |  |  | 31301709.915 |
| 23.19000000000012 |  |  |  | 32080014.145 |
| 23.22000000000012 |  |  |  | 32877603.554 |
| 23.25000000000012 |  |  |  | 33694954.52 |
| 23.28000000000013 |  |  |  | 34532555.159 |
| 23.31000000000013 |  |  |  | 35390905.609 |
| 23.34000000000013 |  |  |  | 36270518.326 |
| 23.37000000000013 |  |  |  | 37171918.39 |
| 23.40000000000013 |  |  |  | 38095643.808 |
| 23.43000000000013 |  |  |  | 39042245.84 |
| 23.46000000000013 |  |  |  | 40012289.318 |
| 23.49000000000013 |  |  |  | 41006352.984 |
| 23.52000000000013 |  |  |  | 42025029.826 |
| 23.55000000000014 |  |  |  | 43068927.436 |
| 23.58000000000014 |  |  |  | 44138668.362 |
| 23.61000000000014 |  |  |  | 45234890.475 |
| 23.64000000000014 |  |  |  | 46358247.352 |
| 23.67000000000014 |  |  |  | 47509408.655 |
| 23.70000000000014 |  |  |  | 48689060.528 |
| 23.73000000000014 |  |  |  | 49897906.004 |
| 23.76000000000014 |  |  |  | 51136665.416 |
| 23.79000000000014 |  |  |  | 52406076.823 |
| 23.82000000000015 |  |  |  | 53706896.448 |
| 23.85000000000015 |  |  |  | 55039899.119 |
| 23.88000000000015 |  |  |  | 56405878.73 |
| 23.91000000000015 |  |  |  | 57805648.705 |
| 23.94000000000015 |  |  |  | 59240042.481 |
| 23.97000000000015 |  |  |  | 60709913.999 |
| 24.00000000000015 |  |  |  | 62216138.202 |
| 24.03000000000015 |  |  |  | 63759611.558 |
| 24.06000000000016 |  |  |  | 65341252.583 |
| 24.09000000000016 |  |  |  | 66962002.384 |
| 24.12000000000016 |  |  |  | 68622825.211 |
| 24.15000000000016 |  |  |  | 70324709.029 |
| 24.18000000000016 |  |  |  | 72068666.096 |
| 24.21000000000016 |  |  |  | 73855733.561 |
| 24.24000000000016 |  |  |  | 75686974.074 |
| 24.27000000000016 |  |  |  | 77563476.412 |
| 24.30000000000016 |  |  |  | 79486356.118 |
| 24.33000000000017 |  |  |  | 81456756.16 |
| 24.36000000000017 |  |  |  | 83475847.604 |
| 24.39000000000017 |  |  |  | 85544830.299 |
| 24.42000000000017 |  |  |  | 87664933.587 |
| 24.45000000000017 |  |  |  | 89837417.024 |
| 24.48000000000017 |  |  |  | 92063571.125 |
| 24.51000000000017 |  |  |  | 94344718.115 |
| 24.54000000000017 |  |  |  | 96682212.715 |
| 24.57000000000017 |  |  |  | 99077442.934 |
| 24.60000000000018 |  |  |  | 101531830.886 |
| 24.63000000000018 |  |  |  | 104046833.627 |
| 24.66000000000018 |  |  |  | 106623944.01 |
| 24.69000000000018 |  |  |  | 109264691.564 |
| 24.72000000000018 |  |  |  | 111970643.392 |
| 24.75000000000018 |  |  |  | 114743405.094 |
| 24.78000000000018 |  |  |  | 117584621.707 |
| 24.81000000000018 |  |  |  | 120495978.675 |
| 24.84000000000018 |  |  |  | 123479202.836 |
| 24.87000000000019 |  |  |  | 126536063.44 |
| 24.90000000000019 |  |  |  | 129668373.186 |
| 24.93000000000019 |  |  |  | 132877989.285 |
| 24.96000000000019 |  |  |  | 136166814.556 |
| 24.99000000000019 |  |  |  | 139536798.539 |
| 25.02000000000019 |  |  |  | 142989938.639 |
| 25.05000000000019 |  |  |  | 146528281.304 |
| 25.08000000000019 |  |  |  | 150153923.219 |
| 25.11000000000019 |  |  |  | 153869012.544 |
| 25.1400000000002 |  |  |  | 157675750.17 |
| 25.1700000000002 |  |  |  | 161576391.011 |
| 25.2000000000002 |  |  |  | 165573245.332 |
| 25.2300000000002 |  |  |  | 169668680.096 |
| 25.2600000000002 |  |  |  | 173865120.36 |
| 25.2900000000002 |  |  |  | 178165050.697 |
| 25.3200000000002 |  |  |  | 182571016.647 |
| 25.3500000000002 |  |  |  | 187085626.22 |
| 25.38000000000021 |  |  |  | 191711551.415 |
| 25.41000000000021 |  |  |  | 196451529.796 |
| 25.44000000000021 |  |  |  | 201308366.091 |
| 25.47000000000021 |  |  |  | 206284933.839 |
| 25.50000000000021 |  |  |  | 211384177.075 |
| 25.53000000000021 |  |  |  | 216609112.053 |
| 25.56000000000021 |  |  |  | 221962829.019 |
| 25.59000000000021 |  |  |  | 227448494.015 |
| 25.62000000000021 |  |  |  | 233069350.742 |
| 25.65000000000022 |  |  |  | 238828722.454 |
| 25.68000000000022 |  |  |  | 244730013.91 |
| 25.71000000000022 |  |  |  | 250776713.367 |
| 25.74000000000022 |  |  |  | 256972394.621 |
| 25.77000000000022 |  |  |  | 263320719.103 |
| 25.80000000000022 |  |  |  | 269825438.026 |
| 25.83000000000022 |  |  |  | 276490394.574 |
| 25.86000000000022 |  |  |  | 283319526.161 |
| 25.89000000000022 |  |  |  | 290316866.729 |
| 25.92000000000023 |  |  |  | 297486549.117 |
| 25.95000000000023 |  |  |  | 304832807.473 |
| 25.98000000000023 |  |  |  | 312359979.739 |
| 26.01000000000023 |  |  |  | 320072510.186 |
| 26.04000000000023 |  |  |  | 327974952.016 |
| 26.07000000000023 |  |  |  | 336071970.027 |
| 26.10000000000023 |  |  |  | 344368343.34 |
| 26.13000000000023 |  |  |  | 352868968.2 |
| 26.16000000000023 |  |  |  | 361578860.837 |
| 26.19000000000024 |  |  |  | 370503160.4 |
| 26.22000000000024 |  |  |  | 379647131.964 |
| 26.25000000000024 |  |  |  | 389016169.611 |
| 26.28000000000024 |  |  |  | 398615799.581 |
| 26.31000000000024 |  |  |  | 408451683.507 |
| 26.34000000000024 |  |  |  | 418529621.722 |
| 26.37000000000024 |  |  |  | 428855556.654 |
| 26.40000000000024 |  |  |  | 439435576.295 |
| 26.43000000000024 |  |  |  | 450275917.766 |
| 26.46000000000025 |  |  |  | 461382970.957 |
| 26.49000000000025 |  |  |  | 472763282.263 |
| 26.52000000000025 |  |  |  | 484423558.413 |
| 26.55000000000025 |  |  |  | 496370670.383 |
| 26.58000000000025 |  |  |  | 508611657.416 |
| 26.61000000000025 |  |  |  | 521153731.131 |
| 26.64000000000025 |  |  |  | 534004279.739 |
| 26.67000000000025 |  |  |  | 547170872.355 |
| 26.70000000000026 |  |  |  | 560661263.421 |
| 26.73000000000026 |  |  |  | 574483397.236 |
| 26.76000000000026 |  |  |  | 588645412.592 |
| 26.79000000000026 |  |  |  | 603155647.529 |
| 26.82000000000026 |  |  |  | 618022644.203 |
| 26.85000000000026 |  |  |  | 633255153.872 |
| 26.88000000000026 |  |  |  | 648862142.004 |
| 26.91000000000026 |  |  |  | 664852793.514 |
| 26.94000000000026 |  |  |  | 681236518.12 |
| 26.97000000000027 |  |  |  | 698022955.837 |
| 27.00000000000027 |  |  |  | 715221982.605 |
| 27.03000000000027 |  |  |  | 732843716.047 |
| 27.06000000000027 |  |  |  | 750898521.375 |
| 27.09000000000027 |  |  |  | 769397017.435 |
| 27.12000000000027 |  |  |  | 788350082.906 |
| 27.15000000000027 |  |  |  | 807768862.642 |
| 27.18000000000027 |  |  |  | 827664774.171 |
| 27.21000000000027 |  |  |  | 848049514.357 |
| 27.24000000000028 |  |  |  | 868935066.222 |
| 27.27000000000028 |  |  |  | 890333705.929 |
| 27.30000000000028 |  |  |  | 912258009.942 |
| 27.33000000000028 |  |  |  | 934720862.359 |
| 27.36000000000028 |  |  |  | 957735462.423 |
| 27.39000000000028 |  |  |  | 981315332.214 |
| 27.42000000000028 |  |  |  | 1005474324.532 |
| 27.45000000000028 |  |  |  | 1030226630.969 |
| 27.48000000000028 |  |  |  | 1055586790.183 |
| 27.51000000000029 |  |  |  | 1081569696.364 |
| 27.54000000000029 |  |  |  | 1108190607.918 |
| 27.57000000000029 |  |  |  | 1135465156.354 |
| 27.60000000000029 |  |  |  | 1163409355.39 |
| 27.6300000000003 |  |  |  | 1192039610.282 |
| 27.66000000000029 |  |  |  | 1221372727.381 |
| 27.69000000000029 |  |  |  | 1251425923.917 |
| 27.72000000000029 |  |  |  | 1282216838.032 |
| 27.75000000000029 |  |  |  | 1313763539.045 |
| 27.7800000000003 |  |  |  | 1346084537.978 |
| 27.8100000000003 |  |  |  | 1379198798.33 |
| 27.8400000000003 |  |  |  | 1413125747.121 |
| 27.8700000000003 |  |  |  | 1447885286.197 |
| 27.9000000000003 |  |  |  | 1483497803.818 |
| 27.9300000000003 |  |  |  | 1519984186.521 |
| 27.9600000000003 |  |  |  | 1557365831.279 |
| 27.9900000000003 |  |  |  | 1595664657.953 |
| 28.02000000000031 |  |  |  | 1634903122.044 |
| 28.05000000000031 |  |  |  | 1675104227.759 |
| 28.08000000000031 |  |  |  | 1716291541.399 |
| 28.11000000000031 |  |  |  | 1758489205.064 |
| 28.14000000000031 |  |  |  | 1801721950.698 |
| 28.17000000000031 |  |  |  | 1846015114.477 |
| 28.20000000000031 |  |  |  | 1891394651.538 |
| 28.23000000000031 |  |  |  | 1937887151.084 |
| 28.26000000000031 |  |  |  | 1985519851.837 |
| 28.29000000000032 |  |  |  | 2034320657.878 |
| 28.32000000000032 |  |  |  | 2084318154.878 |
| 28.35000000000032 |  |  |  | 2135541626.707 |
| 28.38000000000032 |  |  |  | 2188021072.465 |
| 28.41000000000032 |  |  |  | 2241787223.918 |
| 28.44000000000032 |  |  |  | 2296871563.358 |
| 28.47000000000032 |  |  |  | 2353306341.903 |
| 28.50000000000032 |  |  |  | 2411124598.242 |
| 28.53000000000032 |  |  |  | 2470360177.826 |
| 28.56000000000033 |  |  |  | 2531047752.542 |
| 28.59000000000033 |  |  |  | 2593222840.854 |
| 28.62000000000033 |  |  |  | 2656921828.44 |
| 28.65000000000033 |  |  |  | 2722181989.324 |
| 28.68000000000033 |  |  |  | 2789041507.534 |
| 28.71000000000033 |  |  |  | 2857539499.279 |
| 28.74000000000033 |  |  |  | 2927716035.661 |
| 28.77000000000033 |  |  |  | 2999612165.955 |
| 28.80000000000033 |  |  |  | 3073269941.44 |
| 28.83000000000034 |  |  |  | 3148732439.815 |
| 28.86000000000034 |  |  |  | 3226043790.217 |
| 28.89000000000034 |  |  |  | 3305249198.831 |
| 28.92000000000034 |  |  |  | 3386394975.143 |
| 28.95000000000034 |  |  |  | 3469528558.813 |
| 28.98000000000034 |  |  |  | 3554698547.212 |
| 29.01000000000034 |  |  |  | 3641954723.633 |
| 29.04000000000034 |  |  |  | 3731348086.172 |
| 29.07000000000034 |  |  |  | 3822930877.331 |
| 29.10000000000035 |  |  |  | 3916756614.326 |
| 29.13000000000035 |  |  |  | 4012880120.139 |
| 29.16000000000035 |  |  |  | 4111357555.325 |
| 29.19000000000035 |  |  |  | 4212246450.592 |
| 29.22000000000035 |  |  |  | 4315605740.171 |
| 29.25000000000035 |  |  |  | 4421495796.003 |
| 29.28000000000035 |  |  |  | 4529978462.749 |
| 29.31000000000035 |  |  |  | 4641117093.661 |
| 29.34000000000036 |  |  |  | 4754976587.315 |
| 29.37000000000036 |  |  |  | 4871623425.249 |
| 29.40000000000036 |  |  |  | 4991125710.506 |
| 29.43000000000036 |  |  |  | 5113553207.119 |
| 29.46000000000036 |  |  |  | 5238977380.552 |
| 29.49000000000036 |  |  |  | 5367471439.134 |
| 29.52000000000036 |  |  |  | 5499110376.486 |
| 29.55000000000036 |  |  |  | 5633971014.992 |
| 29.58000000000036 |  |  |  | 5772132050.318 |
| 29.61000000000037 |  |  |  | 5913674097.021 |
| 29.64000000000037 |  |  |  | 6058679735.259 |
| 29.67000000000037 |  |  |  | 6207233558.641 |
| 29.70000000000037 |  |  |  | 6359422223.242 |
| 29.73000000000037 |  |  |  | 6515334497.802 |
| 29.76000000000037 |  |  |  | 6675061315.151 |
| 29.79000000000037 |  |  |  | 6838695824.884 |
| 29.82000000000037 |  |  |  | 7006333447.313 |
| 29.85000000000037 |  |  |  | 7178071928.731 |
| 29.88000000000038 |  |  |  | 7354011398.025 |
| 29.91000000000038 |  |  |  | 7534254424.649 |
| 29.94000000000038 |  |  |  | 7718906078.029 |
| 29.97000000000038 |  |  |  | 7908073988.389 |
| 30.00000000000038 |  |  |  | 8101868409.069 |
| 30.03000000000038 |  |  |  | 8300402280.352 |
| 30.06000000000038 |  |  |  | 8503791294.845 |
| 30.09000000000038 |  |  |  | 8712153964.442 |
| 30.12000000000038 |  |  |  | 8925611688.924 |
| 30.15000000000039 |  |  |  | 9144288826.212 |
| 30.18000000000039 |  |  |  | 9368312764.345 |
| 30.21000000000039 |  |  |  | 9597813995.186 |
| 30.24000000000039 |  |  |  | 9832926189.935 |
| 30.27000000000039 |  |  |  | 10073786276.469 |
| 30.30000000000039 |  |  |  | 10320534518.559 |
| 30.33000000000039 |  |  |  | 10573314597.017 |
| 30.36000000000039 |  |  |  | 10832273692.81 |
| 30.39000000000039 |  |  |  | 11097562572.194 |
| 30.4200000000004 |  |  |  | 11369335673.913 |
| 30.4500000000004 |  |  |  | 11647751198.521 |
| 30.4800000000004 |  |  |  | 11932971199.87 |
| 30.5100000000004 |  |  |  | 12225161678.819 |
| 30.5400000000004 |  |  |  | 12524492679.221 |
| 30.5700000000004 |  |  |  | 12831138386.24 |
| 30.6000000000004 |  |  |  | 13145277227.055 |
| 30.6300000000004 |  |  |  | 13467091974.012 |
| 30.66000000000041 |  |  |  | 13796769850.274 |
| 30.69000000000041 |  |  |  | 14134502638.043 |
| 30.72000000000041 |  |  |  | 14480486789.411 |
| 30.75000000000041 |  |  |  | 14834923539.894 |
| 30.78000000000041 |  |  |  | 15198019024.728 |
| 30.81000000000041 |  |  |  | 15569984397.99 |
| 30.84000000000041 |  |  |  | 15951035954.608 |
| 30.87000000000041 |  |  |  | 16341395255.331 |
| 30.90000000000041 |  |  |  | 16741289254.741 |
| 30.93000000000042 |  |  |  | 17150950432.361 |
| 30.96000000000042 |  |  |  | 17570616926.954 |
| 30.99000000000042 |  |  |  | 18000532674.08 |
| 31.02000000000042 |  |  |  | 18440947546.991 |
| 31.05000000000042 |  |  |  | 18892117500.944 |
| 31.08000000000042 |  |  |  | 19354304721.022 |
| 31.11000000000042 |  |  |  | 19827777773.538 |
| 31.14000000000042 |  |  |  | 20312811761.112 |
| 31.17000000000042 |  |  |  | 20809688481.521 |
| 31.20000000000043 |  |  |  | 21318696590.391 |
| 31.23000000000043 |  |  |  | 21840131767.847 |
| 31.26000000000043 |  |  |  | 22374296889.206 |
| 31.29000000000043 |  |  |  | 22921502199.802 |
| 31.32000000000043 |  |  |  | 23482065494.071 |
| 31.35000000000043 |  |  |  | 24056312298.965 |
| 31.38000000000043 |  |  |  | 24644576061.823 |
| 31.41000000000043 |  |  |  | 25247198342.804 |
| 31.44000000000043 |  |  |  | 25864529011.982 |
| 31.47000000000044 |  |  |  | 26496926451.227 |
| 31.50000000000044 |  |  |  | 27144757760.981 |
| 31.53000000000044 |  |  |  | 27808398972.057 |
| 31.56000000000044 |  |  |  | 28488235262.564 |
| 31.59000000000044 |  |  |  | 29184661180.11 |
| 31.62000000000044 |  |  |  | 29898080869.381 |
| 31.65000000000044 |  |  |  | 30628908305.248 |
| 31.68000000000044 |  |  |  | 31377567531.53 |
| 31.71000000000044 |  |  |  | 32144492905.54 |
| 31.74000000000045 |  |  |  | 32930129348.573 |
| 31.77000000000045 |  |  |  | 33734932602.46 |
| 31.80000000000045 |  |  |  | 34559369492.354 |
| 31.83000000000045 |  |  |  | 35403918195.876 |
| 31.86000000000045 |  |  |  | 36269068518.808 |
| 31.89000000000045 |  |  |  | 37155322177.45 |
| 31.92000000000045 |  |  |  | 38063193087.841 |
| 31.95000000000045 |  |  |  | 38993207661.987 |
| 31.98000000000046 |  |  |  | 39945905111.271 |
| 32.01000000000045 |  |  |  | 40921837757.227 |
| 32.04000000000045 |  |  |  | 41921571349.841 |
| 32.07000000000046 |  |  |  | 42945685393.577 |
| 32.10000000000046 |  |  |  | 43994773481.303 |
| 32.13000000000046 |  |  |  | 45069443636.318 |
| 32.16000000000046 |  |  |  | 46170318662.672 |
| 32.19000000000046 |  |  |  | 47298036503.969 |
| 32.22000000000046 |  |  |  | 48453250610.885 |
| 32.25000000000046 |  |  |  | 49636630317.584 |
| 32.28000000000046 |  |  |  | 50848861227.261 |
| 32.31000000000046 |  |  |  | 52090645607.037 |
| 32.34000000000047 |  |  |  | 53362702792.421 |
| 32.37000000000047 |  |  |  | 54665769601.578 |
| 32.40000000000047 |  |  |  | 56000600759.643 |
| 32.43000000000047 |  |  |  | 57367969333.308 |
| 32.46000000000047 |  |  |  | 58768667175.961 |
| 32.49000000000047 |  |  |  | 60203505383.597 |
| 32.52000000000047 |  |  |  | 61673314761.789 |
| 32.55000000000047 |  |  |  | 63178946303.972 |
| 32.58000000000047 |  |  |  | 64721271681.326 |
| 32.61000000000048 |  |  |  | 66301183744.518 |
| 32.64000000000048 |  |  |  | 67919597037.616 |
| 32.67000000000048 |  |  |  | 69577448324.452 |
| 32.70000000000048 |  |  |  | 71275697127.74 |
| 32.73000000000048 |  |  |  | 73015326281.261 |
| 32.76000000000048 |  |  |  | 74797342495.421 |
| 32.79000000000048 |  |  |  | 76622776936.524 |
| 32.82000000000048 |  |  |  | 78492685820.072 |
| 32.85000000000048 |  |  |  | 80408151018.446 |
| 32.88000000000049 |  |  |  | 82370280683.307 |
| 32.91000000000049 |  |  |  | 84380209883.077 |
| 32.94000000000049 |  |  |  | 86439101255.87 |
| 32.97000000000049 |  |  |  | 88548145678.231 |
| 33.0000000000005 |  |  |  | 90708562950.089 |
| 33.0300000000005 |  |  |  | 92921602496.292 |
| 33.0600000000005 |  |  |  | 95188544085.145 |
| 33.0900000000005 |  |  |  | 97510698564.35 |
| 33.1200000000005 |  |  |  | 99889408614.771 |
| 33.1500000000005 |  |  |  | 102326049522.465 |
| 33.1800000000005 |  |  |  | 104822029969.407 |
| 33.2100000000005 |  |  |  | 107378792843.367 |
| 33.2400000000005 |  |  |  | 109997816067.412 |
| 33.2700000000005 |  |  |  | 112680613449.487 |
| 33.3000000000005 |  |  |  | 115428735552.579 |
| 33.3300000000005 |  |  |  | 118243770585.957 |
| 33.3600000000005 |  |  |  | 121127345317.994 |
| 33.3900000000005 |  |  |  | 124081126011.094 |
| 33.42000000000051 |  |  |  | 127106819379.263 |
| 33.45000000000051 |  |  |  | 130206173568.871 |
| 33.48000000000051 |  |  |  | 133380979163.155 |
| 33.51000000000051 |  |  |  | 136633070211.058 |
| 33.54000000000051 |  |  |  | 139964325280.972 |
| 33.57000000000051 |  |  |  | 143376668540.001 |
| 33.60000000000051 |  |  |  | 146872070859.355 |
| 33.63000000000051 |  |  |  | 150452550946.505 |
| 33.66000000000052 |  |  |  | 154120176504.76 |
| 33.69000000000052 |  |  |  | 157877065420.905 |
| 33.72000000000052 |  |  |  | 161725386981.604 |
| 33.75000000000052 |  |  |  | 165667363119.246 |
| 33.78000000000052 |  |  |  | 169705269687.953 |
| 33.81000000000052 |  |  |  | 173841437770.484 |
| 33.84000000000052 |  |  |  | 178078255016.763 |
| 33.87000000000052 |  |  |  | 182418167014.83 |
| 33.90000000000052 |  |  |  | 186863678694.961 |
| 33.93000000000053 |  |  |  | 191417355767.779 |
| 33.96000000000053 |  |  |  | 196081826197.187 |
| 33.99000000000053 |  |  |  | 200859781708.94 |
| 34.02000000000053 |  |  |  | 205753979335.737 |
| 34.05000000000053 |  |  |  | 210767242999.709 |
| 34.08000000000053 |  |  |  | 215902465133.208 |
| 34.11000000000053 |  |  |  | 221162608338.825 |
| 34.14000000000053 |  |  |  | 226550707089.579 |
| 34.17000000000053 |  |  |  | 232069869470.257 |
| 34.20000000000054 |  |  |  | 237723278960.891 |
| 34.23000000000054 |  |  |  | 243514196263.405 |
| 34.26000000000054 |  |  |  | 249445961172.446 |
| 34.29000000000054 |  |  |  | 255521994491.511 |
| 34.32000000000054 |  |  |  | 261745799995.424 |
| 34.35000000000054 |  |  |  | 268120966440.301 |
| 34.38000000000054 |  |  |  | 274651169622.157 |
| 34.41000000000054 |  |  |  | 281340174485.322 |
| 34.44000000000054 |  |  |  | 288191837281.865 |
| 34.47000000000055 |  |  |  | 295210107783.268 |
| 34.50000000000055 |  |  |  | 302399031545.618 |
| 34.53000000000055 |  |  |  | 309762752229.591 |
| 34.56000000000055 |  |  |  | 317305513976.571 |
| 34.59000000000055 |  |  |  | 325031663842.248 |
| 34.62000000000055 |  |  |  | 332945654289.095 |
| 34.65000000000055 |  |  |  | 341052045739.14 |
| 34.68000000000055 |  |  |  | 349355509188.485 |
| 34.71000000000056 |  |  |  | 357860828885.078 |
| 34.74000000000056 |  |  |  | 366572905071.261 |
| 34.77000000000056 |  |  |  | 375496756792.646 |
| 34.80000000000056 |  |  |  | 384637524774.937 |
| 34.83000000000056 |  |  |  | 394000474370.349 |
| 34.86000000000056 |  |  |  | 403590998575.27 |
| 34.89000000000056 |  |  |  | 413414621120.928 |
| 34.92000000000056 |  |  |  | 423476999638.795 |
| 34.95000000000056 |  |  |  | 433783928902.556 |
| 34.98000000000057 |  |  |  | 444341344148.486 |
| 35.01000000000057 |  |  |  | 455155324476.109 |
| 35.04000000000057 |  |  |  | 466232096331.124 |
| 35.07000000000057 |  |  |  | 477578037072.536 |
| 35.10000000000057 |  |  |  | 489199678626.058 |
| 35.13000000000057 |  |  |  | 501103711225.853 |
| 35.16000000000057 |  |  |  | 513296987246.766 |
| 35.19000000000057 |  |  |  | 525786525129.21 |
| 35.22000000000057 |  |  |  | 538579513398.954 |
| 35.25000000000058 |  |  |  | 551683314784.12 |
| 35.28000000000058 |  |  |  | 565105470431.712 |
| 35.31000000000058 |  |  |  | 578853704226.098 |
| 35.34000000000058 |  |  |  | 592935927211.891 |
| 35.37000000000058 |  |  |  | 607360242123.783 |
| 35.40000000000058 |  |  |  | 622134948025.876 |
| 35.43000000000058 |  |  |  | 637268545063.178 |
| 35.46000000000058 |  |  |  | 652769739327.963 |
| 35.49000000000058 |  |  |  | 668647447843.786 |
| 35.52000000000059 |  |  |  | 684910803669.968 |
| 35.55000000000059 |  |  |  | 701569161129.472 |
| 35.58000000000059 |  |  |  | 718632101163.171 |
| 35.61000000000059 |  |  |  | 736109436813.521 |
| 35.6400000000006 |  |  |  | 754011218840.788 |
| 35.6700000000006 |  |  |  | 772347741475.026 |
| 35.7000000000006 |  |  |  | 791129548307.096 |
| 35.7300000000006 |  |  |  | 810367438322.051 |
| 35.7600000000006 |  |  |  | 830072472078.343 |
| 35.7900000000006 |  |  |  | 850255978036.403 |
| 35.8200000000006 |  |  |  | 870929559040.14 |
| 35.8500000000006 |  |  |  | 892105098955.091 |
| 35.8800000000006 |  |  |  | 913794769467.001 |
| 35.9100000000006 |  |  |  | 936011037044.703 |
| 35.9400000000006 |  |  |  | 958766670071.256 |
| 35.9700000000006 |  |  |  | 982074746147.395 |
| 36.0000000000006 |  |  |  | 1005948659571.51 |
| 36.03000000000061 |  |  |  | 1030402129000.32 |
| 36.06000000000061 |  |  |  | 1055449205294.7 |
| 36.09000000000061 |  |  |  | 1081104279555.05 |
| 36.12000000000061 |  |  |  | 1107382091350.86 |
| 36.15000000000061 |  |  |  | 1134297737149.09 |
| 36.18000000000061 |  |  |  | 1161866678946.17 |
| 36.21000000000061 |  |  |  | 1190104753108.6 |
| 36.24000000000061 |  |  |  | 1219028179427.14 |
| 36.27000000000061 |  |  |  | 1248653570389.72 |
| 36.30000000000062 |  |  |  | 1278997940678.33 |
| 36.33000000000062 |  |  |  | 1310078716895.5 |
| 36.36000000000062 |  |  |  | 1341913747525.53 |
| 36.39000000000062 |  |  |  | 1374521313136.58 |
| 36.42000000000062 |  |  |  | 1407920136829.03 |
| 36.45000000000062 |  |  |  | 1442129394936.34 |
| 36.48000000000062 |  |  |  | 1477168727984.38 |
| 36.51000000000062 |  |  |  | 1513058251915.41 |
| 36.54000000000062 |  |  |  | 1549818569583.31 |
| 36.57000000000063 |  |  |  | 1587470782526.35 |
| 36.60000000000063 |  |  |  | 1626036503024.36 |
| 36.63000000000063 |  |  |  | 1665537866447.06 |
| 36.66000000000063 |  |  |  | 1705997543900.79 |
| 36.69000000000063 |  |  |  | 1747438755180.48 |
| 36.72000000000063 |  |  |  | 1789885282034.52 |
| 36.75000000000063 |  |  |  | 1833361481750.05 |
| 36.78000000000063 |  |  |  | 1877892301066.25 |
| 36.81000000000063 |  |  |  | 1923503290423.63 |
| 36.84000000000064 |  |  |  | 1970220618557.46 |
| 36.87000000000064 |  |  |  | 2018071087443.63 |
| 36.90000000000064 |  |  |  | 2067082147605.39 |
| 36.93000000000064 |  |  |  | 2117281913789.7 |
| 36.96000000000064 |  |  |  | 2168699181022.16 |
| 36.99000000000064 |  |  |  | 2221363441049.54 |
| 37.02000000000064 |  |  |  | 2275304899179.44 |
| 37.05000000000064 |  |  |  | 2330554491526.37 |
| 37.08000000000064 |  |  |  | 2387143902674.48 |
| 37.11000000000065 |  |  |  | 2445105583766.5 |
| 37.14000000000065 |  |  |  | 2504472771029.55 |
| 37.17000000000065 |  |  |  | 2565279504748.21 |
| 37.20000000000065 |  |  |  | 2627560648695.61 |
| 37.23000000000065 |  |  |  | 2691351910033.67 |
| 37.26000000000065 |  |  |  | 2756689859693.68 |
| 37.29000000000065 |  |  |  | 2823611953249.02 |
| 37.32000000000065 |  |  |  | 2892156552291.67 |
| 37.35000000000066 |  |  |  | 2962362946324.74 |
| 37.38000000000066 |  |  |  | 3034271375183.47 |
| 37.41000000000066 |  |  |  | 3107923051997.56 |
| 37.44000000000066 |  |  |  | 3183360186707.59 |
| 37.47000000000066 |  |  |  | 3260626010149.26 |
| 37.50000000000066 |  |  |  | 3339764798718.77 |
| 37.53000000000066 |  |  |  | 3420821899633.73 |
| 37.56000000000066 |  |  |  | 3503843756803.64 |
| 37.59000000000066 |  |  |  | 3588877937324.82 |
| 37.62000000000067 |  |  |  | 3675973158614.8 |
| 37.65000000000067 |  |  |  | 3765179316201.58 |
| 37.68000000000067 |  |  |  | 3856547512183.6 |
| 37.71000000000067 |  |  |  | 3950130084376.43 |
| 37.74000000000067 |  |  |  | 4045980636163.03 |
| 37.77000000000067 |  |  |  | 4144154067064.26 |
| 37.80000000000067 |  |  |  | 4244706604047.09 |
| 37.83000000000067 |  |  |  | 4347695833588.5 |
| 37.86000000000067 |  |  |  | 4453180734512.86 |
| 37.89000000000068 |  |  |  | 4561221711621.93 |
| 37.92000000000068 |  |  |  | 4671880630136.14 |
| 37.95000000000068 |  |  |  | 4785220850967.12 |
| 37.98000000000068 |  |  |  | 4901307266841.19 |
| 38.01000000000068 |  |  |  | 5020206339294.41 |
| 38.04000000000068 |  |  |  | 5141986136560.42 |
| 38.07000000000068 |  |  |  | 5266716372372.23 |
| 38.10000000000068 |  |  |  | 5394468445700.29 |
| 38.13000000000068 |  |  |  | 5525315481449.21 |
| 38.16000000000069 |  |  |  | 5659332372136.4 |
| 38.19000000000069 |  |  |  | 5796595820576.2 |
| 38.22000000000069 |  |  |  | 5937184383593.71 |
| 38.25000000000069 |  |  |  | 6081178516793.16 |
| 38.2800000000007 |  |  |  | 6228660620406.43 |
| 38.31000000000069 |  |  |  | 6379715086247.43 |
| 38.34000000000069 |  |  |  | 6534428345799.08 |
| 38.37000000000069 |  |  |  | 6692888919460.55 |
| 38.40000000000069 |  |  |  | 6855187466982.09 |
| 38.4300000000007 |  |  |  | 7021416839116.68 |
| 38.4600000000007 |  |  |  | 7191672130517.29 |
| 38.4900000000007 |  |  |  | 7366050733910.32 |
| 38.5200000000007 |  |  |  | 7544652395575.51 |
| 38.5500000000007 |  |  |  | 7727579272163.91 |
| 38.5800000000007 |  |  |  | 7914935988886.51 |
| 38.6100000000007 |  |  |  | 8106829699105.97 |
| 38.6400000000007 |  |  |  | 8303370145365.75 |
| 38.6700000000007 |  |  |  | 8504669721890.94 |
| 38.7000000000007 |  |  |  | 8710843538596.62 |
| 38.7300000000007 |  |  |  | 8922009486639.68 |
| 38.7600000000007 |  |  |  | 9138288305551.51 |
| 38.7900000000007 |  |  |  | 9359803651989.54 |
| 38.82000000000071 |  |  |  | 9586682170146.97 |
| 38.85000000000071 |  |  |  | 9819053563860.03 |
| 38.88000000000071 |  |  |  | 10057050670454.1 |
| 38.91000000000071 |  |  |  | 10300809536370.9 |
| 38.94000000000072 |  |  |  | 10550469494618.4 |
| 38.97000000000072 |  |  |  | 10806173244089.2 |
| 39.00000000000072 |  |  |  | 11068066930790.7 |
| 39.03000000000072 |  |  |  | 11336300231034.1 |
| 39.06000000000072 |  |  |  | 11611026436629.2 |
| 39.09000000000072 |  |  |  | 11892402542133.1 |
| 39.12000000000072 |  |  |  | 12180589334202.5 |
| 39.15000000000072 |  |  |  | 12475751483100.6 |
| 39.18000000000072 |  |  |  | 12778057636409.2 |
| 39.21000000000072 |  |  |  | 13087680515001 |
| 39.24000000000072 |  |  |  | 13404797011325.1 |
| 39.27000000000072 |  |  |  | 13729588290062 |
| 39.30000000000073 |  |  |  | 14062239891204.7 |
| 39.33000000000073 |  |  |  | 14402941835625.8 |
| 39.36000000000073 |  |  |  | 14751888733188 |
| 39.39000000000073 |  |  |  | 15109279893461.6 |
| 39.42000000000073 |  |  |  | 15475319439110.2 |
| 39.45000000000073 |  |  |  | 15850216422010.3 |
| 39.48000000000074 |  |  |  | 16234184942168.7 |
| 39.51000000000074 |  |  |  | 16627444269507.7 |
| 39.54000000000074 |  |  |  | 17030218968584 |
| 39.57000000000074 |  |  |  | 17442739026314.9 |
| 39.60000000000074 |  |  |  | 17865239982782.6 |
| 39.63000000000074 |  |  |  | 18297963065190.6 |
| 39.66000000000074 |  |  |  | 18741155325049.6 |
| 39.69000000000074 |  |  |  | 19195069778668.5 |
| 39.72000000000074 |  |  |  | 19659965551031.9 |
| 39.75000000000074 |  |  |  | 20136108023145.2 |
| 39.78000000000074 |  |  |  | 20623768982929.8 |
| 39.81000000000075 |  |  |  | 21123226779755.5 |
| 39.84000000000075 |  |  |  | 21634766482696.1 |
| 39.87000000000075 |  |  |  | 22158680042599.4 |
| 39.90000000000075 |  |  |  | 22695266458061.9 |
| 39.93000000000075 |  |  |  | 23244831945403.4 |
| 39.96000000000075 |  |  |  | 23807690112737 |
| 39.99000000000075 |  |  |  | 24384162138233.8 |
| 40.02000000000075 |  |  |  | 24974576952682.8 |
| 40.05000000000076 |  |  |  | 25579271426449.6 |
| 40.08000000000076 |  |  |  | 26198590560939.5 |
| 40.11000000000076 |  |  |  | 26832887684674.1 |
| 40.14000000000076 |  |  |  | 27482524654091.8 |
| 40.17000000000076 |  |  |  | 28147872059186.1 |
| 40.20000000000076 |  |  |  | 28829309434098.6 |
| 40.23000000000076 |  |  |  | 29527225472785.4 |
| 40.26000000000076 |  |  |  | 30242018249878.9 |
| 40.29000000000076 |  |  |  | 30974095446871 |
| 40.32000000000077 |  |  |  | 31723874583745 |
| 40.35000000000077 |  |  |  | 32491783256187.4 |
| 40.38000000000077 |  |  |  | 33278259378513.9 |
| 40.41000000000077 |  |  |  | 34083751432447.9 |
| 40.44000000000077 |  |  |  | 34908718721891.5 |
| 40.47000000000077 |  |  |  | 35753631633833.2 |
| 40.50000000000077 |  |  |  | 36618971905540.1 |
| 40.53000000000077 |  |  |  | 37505232898187.7 |
| 40.56000000000077 |  |  |  | 38412919877078.3 |
| 40.59000000000077 |  |  |  | 39342550298610.2 |
| 40.62000000000077 |  |  |  | 40294654104159.2 |
| 40.65000000000078 |  |  |  | 41269774021037.4 |
| 40.68000000000078 |  |  |  | 42268465870701 |
| 40.71000000000078 |  |  |  | 43291298884381 |
| 40.74000000000078 |  |  |  | 44338856026316.7 |
| 40.77000000000078 |  |  |  | 45411734324772.3 |
| 40.80000000000079 |  |  |  | 46510545211026.3 |
| 40.83000000000079 |  |  |  | 47635914866524.5 |
| 40.86000000000079 |  |  |  | 48788484578393.8 |
| 40.89000000000079 |  |  |  | 49968911103516.8 |
| 40.9200000000008 |  |  |  | 51177867041373.6 |
| 40.9500000000008 |  |  |  | 52416041215863.1 |
| 40.9800000000008 |  |  |  | 53684139066318.2 |
| 41.0100000000008 |  |  |  | 54982883047936.2 |
| 41.0400000000008 |  |  |  | 56313013041851.8 |
| 41.0700000000008 |  |  |  | 57675286775084.9 |
| 41.1000000000008 |  |  |  | 59070480250599.7 |
| 41.1300000000008 |  |  |  | 60499388187718.1 |
| 41.1600000000008 |  |  |  | 61962824473139.1 |
| 41.1900000000008 |  |  |  | 63461622622816.4 |
| 41.2200000000008 |  |  |  | 64996636254956.6 |
| 41.2500000000008 |  |  |  | 66568739574405.3 |
| 41.2800000000008 |  |  |  | 68178827868697.1 |
| 41.31000000000081 |  |  |  | 69827818016046.2 |
| 41.34000000000081 |  |  |  | 71516649005567.3 |
| 41.37000000000081 |  |  |  | 73246282470022 |
| 41.40000000000081 |  |  |  | 75017703231390 |
| 41.43000000000081 |  |  |  | 76831919859573.7 |
| 41.46000000000081 |  |  |  | 78689965244552.5 |
| 41.49000000000081 |  |  |  | 80592897182312.8 |
| 41.52000000000081 |  |  |  | 82541798974880.6 |
| 41.55000000000081 |  |  |  | 84537780044798.1 |
| 41.58000000000082 |  |  |  | 86581976564393.6 |
| 41.61000000000082 |  |  |  | 88675552100197 |
| 41.64000000000082 |  |  |  | 90819698272867.6 |
| 41.67000000000082 |  |  |  | 93015635433006.4 |
| 41.70000000000082 |  |  |  | 95264613353235.7 |
| 41.73000000000082 |  |  |  | 97567911936933.8 |
| 41.76000000000082 |  |  |  | 99926841944034.4 |
| 41.79000000000082 |  |  |  | 102342745734289 |
| 41.82000000000082 |  |  |  | 104816998028419 |
| 41.85000000000083 |  |  |  | 107351006687593 |
| 41.88000000000083 |  |  |  | 109946213511654 |
| 41.91000000000083 |  |  |  | 112604095056567 |
| 41.94000000000083 |  |  |  | 115326163471532 |
| 41.97000000000083 |  |  |  | 118113967356250 |
| 42.00000000000083 |  |  |  | 120969092638815 |
| 42.03000000000083 |  |  |  | 123893163474732 |
| 42.06000000000083 |  |  |  | 126887843167570 |
| 42.09000000000083 |  |  |  | 129954835111778 |
| 42.12000000000083 |  |  |  | 133095883758174 |
| 42.15000000000084 |  |  |  | 136312775602676 |
| 42.18000000000084 |  |  |  | 139607340198830 |
| 42.21000000000084 |  |  |  | 142981451194687 |
| 42.24000000000084 |  |  |  | 146437027394643 |
| 42.27000000000084 |  |  |  | 149976033846825 |
| 42.30000000000084 |  |  |  | 153600482956634 |
| 42.33000000000084 |  |  |  | 157312435627092 |
| 42.36000000000084 |  |  |  | 161114002426616 |
| 42.39000000000084 |  |  |  | 165007344784897 |
| 42.42000000000084 |  |  |  | 168994676217545 |
| 42.45000000000085 |  |  |  | 173078263580202 |
| 42.48000000000085 |  |  |  | 177260428352826 |
| 42.51000000000085 |  |  |  | 181543547954871 |
| 42.54000000000085 |  |  |  | 185930057092108 |
| 42.57000000000085 |  |  |  | 190422449135856 |
| 42.60000000000085 |  |  |  | 195023277535369 |
| 42.63000000000085 |  |  |  | 199735157264234 |
| 42.66000000000085 |  |  |  | 204560766301538 |
| 42.69000000000085 |  |  |  | 209502847148672 |
| 42.72000000000085 |  |  |  | 214564208382630 |
| 42.75000000000086 |  |  |  | 219747726246661 |
| 42.78000000000086 |  |  |  | 225056346279196 |
| 42.81000000000086 |  |  |  | 230493084981939 |
| 42.84000000000086 |  |  |  | 236061031528107 |
| 42.87000000000086 |  |  |  | 241763349511736 |
| 42.90000000000087 |  |  |  | 247603278739073 |
| 42.93000000000087 |  |  |  | 253584137063058 |
| 42.96000000000087 |  |  |  | 259709322261922 |
| 42.99000000000087 |  |  |  | 265982313962970 |
| 43.02000000000087 |  |  |  | 272406675612636 |
| 43.05000000000087 |  |  |  | 278986056493920 |
| 43.08000000000087 |  |  |  | 285724193792345 |
| 43.11000000000087 |  |  |  | 292624914711589 |
| 43.14000000000087 |  |  |  | 299692138640018 |
| 43.17000000000087 |  |  |  | 306929879369303 |
| 43.20000000000087 |  |  |  | 314342247366404 |
| 43.23000000000087 |  |  |  | 321933452100178 |
| 43.26000000000087 |  |  |  | 329707804423961 |
| 43.29000000000088 |  |  |  | 337669719015419 |
| 43.32000000000088 |  |  |  | 345823716875083 |
| 43.35000000000088 |  |  |  | 354174427884968 |
| 43.38000000000088 |  |  |  | 362726593428710 |
| 43.41000000000088 |  |  |  | 371485069074710 |
| 43.44000000000089 |  |  |  | 380454827323793 |
| 43.47000000000089 |  |  |  | 389640960422944 |
| 43.50000000000089 |  |  |  | 399048683246684 |
| 43.53000000000089 |  |  |  | 408683336247741 |
| 43.5600000000009 |  |  |  | 418550388478655 |
| 43.5900000000009 |  |  |  | 428655440686040 |
| 43.6200000000009 |  |  |  | 439004228479245 |
| 43.6500000000009 |  |  |  | 449602625575175 |
| 43.6800000000009 |  |  |  | 460456647121164 |
| 43.7100000000009 |  |  |  | 471572453097700 |
| 43.7400000000009 |  |  |  | 482956351802975 |
| 43.7700000000009 |  |  |  | 494614803421202 |
| 43.8000000000009 |  |  |  | 506554423676716 |
| 43.8300000000009 |  |  |  | 518781987575924 |
| 43.8600000000009 |  |  |  | 531304433239209 |
| 43.8900000000009 |  |  |  | 544128865824939 |
| 43.9200000000009 |  |  |  | 557262561547835 |
| 43.95000000000091 |  |  |  | 570712971793905 |
| 43.98000000000091 |  |  |  | 584487727334310 |
| 44.01000000000091 |  |  |  | 598594642640513 |
| 44.04000000000091 |  |  |  | 613041720303162 |
| 44.07000000000091 |  |  |  | 627837155557190 |
| 44.10000000000091 |  |  |  | 642989340915661 |
| 44.13000000000091 |  |  |  | 658506870915037 |
| 44.16000000000091 |  |  |  | 674398546974471 |
| 44.19000000000091 |  |  |  | 690673382371898 |
| 44.22000000000091 |  |  |  | 707340607339737 |
| 44.25000000000092 |  |  |  | 724409674283063 |
| 44.28000000000092 |  |  |  | 741890263123194 |
| 44.31000000000092 |  |  |  | 759792286769687 |
| 44.34000000000092 |  |  |  | 778125896723895 |
| 44.37000000000092 |  |  |  | 796901488817135 |
| 44.40000000000092 |  |  |  | 816129709086800 |
| 44.43000000000092 |  |  |  | 835821459793672 |
| 44.46000000000092 |  |  |  | 855987905583845 |
| 44.49000000000092 |  |  |  | 876640479798738 |
| 44.52000000000092 |  |  |  | 897790890936710 |
| 44.55000000000093 |  |  |  | 919451129270018 |
| 44.58000000000093 |  |  |  | 941633473620717 |
| 44.61000000000093 |  |  |  | 964350498299422 |
| 44.64000000000093 |  |  |  | 987615080210797 |
| 44.67000000000093 |  |  |  | 1011440406129780 |
| 44.70000000000093 |  |  |  | 1035839980152650 |
| 44.73000000000093 |  |  |  | 1060827631327120 |
| 44.76000000000093 |  |  |  | 1086417521465820 |
| 44.79000000000093 |  |  |  | 1112624153147430 |
| 44.82000000000094 |  |  |  | 1139462377910120 |
| 44.85000000000094 |  |  |  | 1166947404641880 |
| 44.88000000000094 |  |  |  | 1195094808172340 |
| 44.91000000000094 |  |  |  | 1223920538071130 |
| 44.94000000000094 |  |  |  | 1253440927657520 |
| 44.97000000000094 |  |  |  | 1283672703226660 |
| 45.00000000000094 |  |  |  | 1314632993497330 |
| 45.03000000000094 |  |  |  | 1346339339286760 |
| 45.06000000000094 |  |  |  | 1378809703417870 |
| 45.09000000000094 |  |  |  | 1412062480864480 |
| 45.12000000000094 |  |  |  | 1446116509140290 |
| 45.15000000000095 |  |  |  | 1480991078937450 |
| 45.18000000000095 |  |  |  | 1516705945020570 |
| 45.21000000000095 |  |  |  | 1553281337382620 |
| 45.24000000000095 |  |  |  | 1590737972668700 |
| 45.27000000000095 |  |  |  | 1629097065874220 |
| 45.30000000000096 |  |  |  | 1668380342324140 |
| 45.33000000000096 |  |  |  | 1708610049939920 |
| 45.36000000000096 |  |  |  | 1749808971801170 |
| 45.39000000000096 |  |  |  | 1792000439008960 |
| 45.42000000000096 |  |  |  | 1835208343858210 |
| 45.45000000000096 |  |  |  | 1879457153326380 |
| 45.48000000000096 |  |  |  | 1924771922886170 |
| 45.51000000000096 |  |  |  | 1971178310650020 |
| 45.54000000000097 |  |  |  | 2018702591854270 |
| 45.57000000000097 |  |  |  | 2067371673691260 |
| 45.60000000000097 |  |  |  | 2117213110497620 |
| 45.63000000000097 |  |  |  | 2168255119307350 |
| 45.66000000000097 |  |  |  | 2220526595778490 |
| 45.69000000000097 |  |  |  | 2274057130502170 |
| 45.72000000000097 |  |  |  | 2328877025703440 |
| 45.75000000000097 |  |  |  | 2385017312343150 |
| 45.78000000000097 |  |  |  | 2442509767630570 |
| 45.81000000000098 |  |  |  | 2501386932956410 |
| 45.84000000000098 |  |  |  | 2561682132256830 |
| 45.87000000000098 |  |  |  | 2623429490818070 |
| 45.90000000000098 |  |  |  | 2686663954532890 |
| 45.93000000000098 |  |  |  | 2751421309619370 |
| 45.96000000000098 |  |  |  | 2817738202813160 |
| 45.99000000000098 |  |  |  | 2885652162044690 |
| 46.02000000000098 |  |  |  | 2955201617612770 |
| 46.05000000000098 |  |  |  | 3026425923866790 |
| 46.08000000000099 |  |  |  | 3099365381409370 |
| 46.11000000000099 |  |  |  | 3174061259832190 |
| 46.14000000000099 |  |  |  | 3250555820997780 |
| 46.17000000000099 |  |  |  | 3328892342880190 |
| 46.200000000001 |  |  |  | 3409115143978270 |
| 46.230000000001 |  |  |  | 3491269608314810 |
| 46.260000000001 |  |  |  | 3575402211036300 |
| 46.290000000001 |  |  |  | 3661560544626970 |
| 46.320000000001 |  |  |  | 3749793345752310 |
| 46.350000000001 |  |  |  | 3840150522747150 |
| 46.380000000001 |  |  |  | 3932683183763520 |
| 46.410000000001 |  |  |  | 4027443665594400 |
| 46.440000000001 |  |  |  | 4124485563189390 |
| 46.470000000001 |  |  |  | 4223863759878890 |
| 46.500000000001 |  |  |  | 4325634458324070 |
| 46.530000000001 |  |  |  | 4429855212209640 |
| 46.560000000001 |  |  |  | 4536584958697450 |
| 46.590000000001 |  |  |  | 4645884051659260 |
| 46.620000000001 |  |  |  | 4757814295707140 |
| 46.65000000000101 |  |  |  | 4872438981040930 |
| 46.68000000000101 |  |  |  | 4989822919131890 |
| 46.71000000000101 |  |  |  | 5110032479263330 |
| 46.74000000000101 |  |  |  | 5233135625948000 |
| 46.77000000000101 |  |  |  | 5359201957243730 |
| 46.80000000000101 |  |  |  | 5488302743988850 |
| 46.83000000000101 |  |  |  | 5620510969979190 |
| 46.86000000000102 |  |  |  | 5755901373109660 |
| 46.89000000000102 |  |  |  | 5894550487502930 |
| 46.92000000000102 |  |  |  | 6036536686649780 |
| 46.95000000000102 |  |  |  | 6181940227584410 |
| 46.98000000000102 |  |  |  | 6330843296120240 |
| 47.01000000000102 |  |  |  | 6483330053171320 |
| 47.04000000000102 |  |  |  | 6639486682185490 |
| 47.07000000000102 |  |  |  | 6799401437715930 |
| 47.10000000000102 |  |  |  | 6963164695158210 |
| 47.13000000000102 |  |  |  | 7130869001681480 |
| 47.16000000000102 |  |  |  | 7302609128381360 |
| 47.19000000000102 |  |  |  | 7478482123684820 |
| 47.22000000000102 |  |  |  | 7658587368036440 |
| 47.25000000000103 |  |  |  | 7843026629897230 |
| 47.28000000000103 |  |  |  | 8031904123087120 |
| 47.31000000000103 |  |  |  | 8225326565503350 |
| 47.34000000000103 |  |  |  | 8423403239248460 |
| 47.37000000000103 |  |  |  | 8626246052200510 |
| 47.40000000000104 |  |  |  | 8833969601061060 |
| 47.43000000000104 |  |  |  | 9046691235915980 |
| 47.46000000000104 |  |  |  | 9264531126345410 |
| 47.49000000000104 |  |  |  | 9487612329120040 |
| 47.52000000000104 |  |  |  | 9716060857521500 |
| 47.55000000000104 |  |  |  | 9950005752326650 |
| 47.58000000000104 |  |  |  | 10189579154494400 |
| 47.61000000000104 |  |  |  | 10434916379596700 |
| 47.64000000000104 |  |  |  | 10686155994036000 |
| 47.67000000000104 |  |  |  | 10943439893090200 |
| 47.70000000000104 |  |  |  | 11206913380831400 |
| 47.73000000000104 |  |  |  | 11476725251961000 |
| 47.76000000000104 |  |  |  | 11753027875608700 |
| 47.79000000000105 |  |  |  | 12035977281142200 |
| 47.82000000000105 |  |  |  | 12325733246035000 |
| 47.85000000000105 |  |  |  | 12622459385842500 |
| 47.88000000000105 |  |  |  | 12926323246336700 |
| 47.91000000000106 |  |  |  | 13237496397851400 |
| 47.94000000000106 |  |  |  | 13556154531890400 |
| 47.97000000000106 |  |  |  | 13882477560052900 |
| 48.00000000000106 |  |  |  | 14216649715333600 |
| 48.03000000000106 |  |  |  | 14558859655850700 |
| 48.06000000000106 |  |  |  | 14909300571064300 |
| 48.09000000000106 |  |  |  | 15268170290540800 |
| 48.12000000000106 |  |  |  | 15635671395328200 |
| 48.15000000000106 |  |  |  | 16012011332001500 |
| 48.18000000000107 |  |  |  | 16397402529444200 |
| 48.21000000000107 |  |  |  | 16792062518432000 |
| 48.24000000000107 |  |  |  | 17196214054083100 |
| 48.27000000000107 |  |  |  | 17610085241247100 |
| 48.30000000000107 |  |  |  | 18033909662900700 |
| 48.33000000000107 |  |  |  | 18467926511623100 |
| 48.36000000000107 |  |  |  | 18912380724225500 |
| 48.39000000000107 |  |  |  | 19367523119608100 |
| 48.42000000000107 |  |  |  | 19833610539925800 |
| 48.45000000000108 |  |  |  | 20310905995137700 |
| 48.48000000000108 |  |  |  | 20799678811024300 |
| 48.51000000000108 |  |  |  | 21300204780754300 |
| 48.54000000000108 |  |  |  | 21812766320087100 |
| 48.57000000000108 |  |  |  | 22337652626296900 |
| 48.60000000000108 |  |  |  | 22875159840907700 |
| 48.63000000000108 |  |  |  | 23425591216332900 |
| 48.66000000000108 |  |  |  | 23989257286509200 |
| 48.69000000000108 |  |  |  | 24566476041623100 |
| 48.72000000000108 |  |  |  | 25157573107028800 |
| 48.75000000000109 |  |  |  | 25762881926454700 |
| 48.78000000000109 |  |  |  | 26382743949605000 |
| 48.81000000000109 |  |  |  | 27017508824258400 |
| 48.8400000000011 |  |  |  | 27667534592975300 |
| 48.8700000000011 |  |  |  | 28333187894520400 |
| 48.9000000000011 |  |  |  | 29014844170115200 |
| 48.9300000000011 |  |  |  | 29712887874637400 |
| 48.9600000000011 |  |  |  | 30427712692883400 |
| 48.9900000000011 |  |  |  | 31159721761017200 |
| 49.0200000000011 |  |  |  | 31909327893328600 |
| 49.0500000000011 |  |  |  | 32676953814427900 |
| 49.0800000000011 |  |  |  | 33463032397010800 |
| 49.1100000000011 |  |  |  | 34268006905320200 |
| 49.1400000000011 |  |  |  | 35092331244448400 |
| 49.1700000000011 |  |  |  | 35936470215615300 |
| 49.2000000000011 |  |  |  | 36800899777567504 |
| 49.2300000000011 |  |  |  | 37686107314244600 |
| 49.2600000000011 |  |  |  | 38592591908861904 |
| 49.2900000000011 |  |  |  | 39520864624566800 |
| 49.32000000000111 |  |  |  | 40471448791821104 |
| 49.35000000000111 |  |  |  | 41444880302674096 |
| 49.38000000000111 |  |  |  | 42441707912091104 |
| 49.41000000000111 |  |  |  | 43462493546505296 |
| 49.44000000000111 |  |  |  | 44507812619766896 |
| 49.47000000000111 |  |  |  | 45578254356665696 |
| 49.50000000000112 |  |  |  | 46674422124211504 |
| 49.53000000000112 |  |  |  | 47796933770853904 |
| 49.56000000000112 |  |  |  | 48946421973834600 |
| 49.59000000000112 |  |  |  | 50123534594866896 |
| 49.62000000000112 |  |  |  | 51328935044340704 |
| 49.65000000000112 |  |  |  | 52563302654258704 |
| 49.68000000000112 |  |  |  | 53827333060110000 |
| 49.71000000000112 |  |  |  | 55121738591901104 |
| 49.74000000000112 |  |  |  | 56447248674557000 |
| 49.77000000000112 |  |  |  | 57804610237920600 |
| 49.80000000000113 |  |  |  | 59194588136579904 |
| 49.83000000000113 |  |  |  | 60617965579758304 |
| 49.86000000000113 |  |  |  | 62075544571508600 |
| 49.89000000000113 |  |  |  | 63568146361456600 |
| 49.92000000000113 |  |  |  | 65096611906351800 |
| 49.95000000000113 |  |  |  | 66661802342676704 |
| 49.98000000000113 |  |  |  | 68264599470585104 |
| 50.01000000000113 |  |  |  | 69905906249439696 |
| 50.04000000000114 |  |  |  | 71586647305224496 |
| 50.07000000000114 |  |  |  | 73307769450121104 |
| 50.10000000000114 |  |  |  | 75070242214532304 |
| 50.13000000000114 |  |  |  | 76875058391863392 |
| 50.16000000000114 |  |  |  | 78723234596353200 |
| 50.19000000000114 |  |  |  | 80615811834276992 |
| 50.22000000000114 |  |  |  | 82553856088837600 |
| 50.25000000000114 |  |  |  | 84538458919073296 |
| 50.28000000000114 |  |  |  | 86570738073118400 |
| 50.31000000000115 |  |  |  | 88651838116160896 |
| 50.34000000000115 |  |  |  | 90782931073444800 |
| 50.37000000000115 |  |  |  | 92965217088688304 |
| 50.40000000000115 |  |  |  | 95199925098272304 |
| 50.43000000000115 |  |  |  | 97488313521588992 |
| 50.46000000000115 |  |  |  | 99831670967931104 |
| 50.49000000000115 |  |  |  | 102231316960320992 |
| 50.52000000000115 |  |  |  | 104688602676684992 |
| 50.55000000000116 |  |  |  | 107204911708780992 |
| 50.58000000000116 |  |  |  | 109781660839324992 |
| 50.61000000000116 |  |  |  | 112420300837724000 |
| 50.64000000000116 |  |  |  | 115122317274880000 |
| 50.67000000000116 |  |  |  | 117889231357523008 |
| 50.70000000000116 |  |  |  | 120722600782528992 |
| 50.73000000000116 |  |  |  | 123624020611706000 |
| 50.76000000000116 |  |  |  | 126595124167543008 |
| 50.79000000000116 |  |  |  | 129637583950422000 |
| 50.82000000000117 |  |  |  | 132753112577800000 |
| 50.85000000000117 |  |  |  | 135943463745898000 |
| 50.88000000000117 |  |  |  | 139210433214427008 |
| 50.91000000000117 |  |  |  | 142555859814908000 |
| 50.94000000000117 |  |  |  | 145981626483148992 |
| 50.97000000000117 |  |  |  | 149489661316454016 |
| 51.00000000000117 |  |  |  | 153081938656167008 |
| 51.03000000000117 |  |  |  | 156760480196144000 |
| 51.06000000000117 |  |  |  | 160527356117784000 |
| 51.09000000000117 |  |  |  | 164384686252244992 |
| 51.12000000000117 |  |  |  | 168334641270513984 |
| 51.15000000000118 |  |  |  | 172379443901974016 |
| 51.18000000000118 |  |  |  | 176521370182161984 |
| 51.21000000000118 |  |  |  | 180762750730432000 |
| 51.24000000000118 |  |  |  | 185105972058209984 |
| 51.27000000000118 |  |  |  | 189553477908587008 |
| 51.30000000000118 |  |  |  | 194107770628011008 |
| 51.33000000000118 |  |  |  | 198771412570830016 |
| 51.36000000000119 |  |  |  | 203547027537479008 |
| 51.39000000000119 |  |  |  | 208437302247111008 |
| 51.42000000000119 |  |  |  | 213444987845520000 |
| 51.45000000000119 |  |  |  | 218572901449161984 |
| 51.4800000000012 |  |  |  | 223823927726168992 |
| 51.5100000000012 |  |  |  | 229201020515232000 |
| 51.5400000000012 |  |  |  | 234707204483256992 |
| 51.5700000000012 |  |  |  | 240345576822724000 |
| 51.6000000000012 |  |  |  | 246119308989696992 |
| 51.6300000000012 |  |  |  | 252031648483475008 |
| 51.6600000000012 |  |  |  | 258085920668847008 |
| 51.6900000000012 |  |  |  | 264285530642000000 |
| 51.7200000000012 |  |  |  | 270633965141121984 |
| 51.7500000000012 |  |  |  | 277134794502751008 |
| 51.7800000000012 |  |  |  | 283791674664984992 |
| 51.8100000000012 |  |  |  | 290608349218667008 |
| 51.8400000000012 |  |  |  | 297588651507684992 |
| 51.87000000000121 |  |  |  | 304736506779590976 |
| 51.90000000000121 |  |  |  | 312055934387699008 |
| 51.93000000000121 |  |  |  | 319551050045937024 |
| 51.96000000000121 |  |  |  | 327226068137688000 |
| 51.99000000000121 |  |  |  | 335085304079924992 |
| 52.02000000000121 |  |  |  | 343133176743964032 |
| 52.05000000000121 |  |  |  | 351374210934171008 |
| 52.08000000000121 |  |  |  | 359813039926049984 |
| 52.11000000000121 |  |  |  | 368454408065089024 |
| 52.14000000000122 |  |  |  | 377303173427844992 |
| 52.17000000000122 |  |  |  | 386364310546745024 |
| 52.20000000000122 |  |  |  | 395642913200145984 |
| 52.23000000000122 |  |  |  | 405144197269188992 |
| 52.26000000000122 |  |  |  | 414873503663062016 |
| 52.29000000000122 |  |  |  | 424836301314321024 |
| 52.32000000000122 |  |  |  | 435038190245913984 |
| 52.35000000000122 |  |  |  | 445484904711651008 |
| 52.38000000000122 |  |  |  | 456182316411862976 |
| 52.41000000000123 |  |  |  | 467136437786060992 |
| 52.44000000000123 |  |  |  | 478353425384427008 |
| 52.47000000000123 |  |  |  | 489839583320020992 |
| 52.50000000000123 |  |  |  | 501601366803665024 |
| 52.53000000000123 |  |  |  | 513645385763430976 |
| 52.56000000000123 |  |  |  | 525978408550809024 |
| 52.59000000000123 |  |  |  | 538607365735592000 |
| 52.62000000000123 |  |  |  | 551539353991622976 |
| 52.65000000000123 |  |  |  | 564781640075576000 |
| 52.68000000000124 |  |  |  | 578341664900966016 |
| 52.71000000000124 |  |  |  | 592227047709737984 |
| 52.74000000000124 |  |  |  | 606445590343682048 |
| 52.77000000000124 |  |  |  | 621005281618123008 |
| 52.80000000000124 |  |  |  | 635914301800322048 |
| 52.83000000000124 |  |  |  | 651181027195069952 |
| 52.86000000000124 |  |  |  | 666814034840080000 |
| 52.89000000000124 |  |  |  | 682822107313739008 |
| 52.92000000000124 |  |  |  | 699214237658016000 |
| 52.95000000000125 |  |  |  | 715999634419152000 |
| 52.98000000000125 |  |  |  | 733187726809047040 |
| 53.01000000000125 |  |  |  | 750788169990194048 |
| 53.04000000000125 |  |  |  | 768810850487111040 |
| 53.07000000000125 |  |  |  | 787265891727320064 |
| 53.10000000000125 |  |  |  | 806163659714952960 |
| 53.13000000000125 |  |  |  | 825514768840147968 |
| 53.16000000000125 |  |  |  | 845330087827544064 |
| 53.19000000000125 |  |  |  | 865620745827111040 |
| 53.22000000000125 |  |  |  | 886398138650792960 |
| 53.25000000000126 |  |  |  | 907673935158428032 |
| 53.28000000000126 |  |  |  | 929460083796500992 |
| 53.31000000000126 |  |  |  | 951768819293427968 |
| 53.34000000000126 |  |  |  | 974612669515037056 |
| 53.37000000000126 |  |  |  | 998004462484210048 |
| 53.40000000000126 |  |  |  | 1021957333568460032 |
| 53.43000000000126 |  |  |  | 1046484732839549952 |
| 53.46000000000127 |  |  |  | 1071600432609309952 |
| 53.49000000000127 |  |  |  | 1097318535145720064 |
| 53.52000000000127 |  |  |  | 1123653480573720064 |
| 53.55000000000127 |  |  |  | 1150620054965090048 |
| 53.58000000000127 |  |  |  | 1178233398621959936 |
| 53.61000000000127 |  |  |  | 1206509014558510080 |
| 53.64000000000127 |  |  |  | 1235462777185740032 |
| 53.67000000000127 |  |  |  | 1265110941203980032 |
| 53.70000000000127 |  |  |  | 1295470150708239872 |
| 53.73000000000127 |  |  |  | 1326557448511569920 |
| 53.76000000000127 |  |  |  | 1358390285691300096 |
| 53.79000000000127 |  |  |  | 1390986531364000000 |
| 53.82000000000128 |  |  |  | 1424364482694119936 |
| 53.85000000000128 |  |  |  | 1458542875142309888 |
| 53.88000000000128 |  |  |  | 1493540892958860032 |
| 53.91000000000128 |  |  |  | 1529378179928300032 |
| 53.94000000000128 |  |  |  | 1566074850371109888 |
| 53.97000000000128 |  |  |  | 1603651500408620032 |
| 54.00000000000129 |  |  |  | 1642129219497590016 |
| 54.03000000000129 |  |  |  | 1681529602240669952 |
| 54.06000000000129 |  |  |  | 1721874760479500032 |
| 54.09000000000129 |  |  |  | 1763187335677220096 |
| 54.1200000000013 |  |  |  | 1805490511597169920 |
| 54.1500000000013 |  |  |  | 1848808027285040128 |
| 54.1800000000013 |  |  |  | 1893164190361570048 |
| 54.2100000000013 |  |  |  | 1938583890633390080 |
| 54.2400000000013 |  |  |  | 1985092614029410048 |
| 54.2700000000013 |  |  |  | 2032716456870739968 |
| 54.3000000000013 |  |  |  | 2081482140481989888 |
| 54.3300000000013 |  |  |  | 2131417026152130048 |
| 54.3600000000013 |  |  |  | 2182549130453380096 |
| 54.3900000000013 |  |  |  | 2234907140926510080 |
| 54.4200000000013 |  |  |  | 2288520432141400064 |
| 54.4500000000013 |  |  |  | 2343419082141980160 |
| 54.4800000000013 |  |  |  | 2399633889284449792 |
| 54.51000000000131 |  |  |  | 2457196389478380032 |
| 54.54000000000131 |  |  |  | 2516138873840330240 |
| 54.57000000000131 |  |  |  | 2576494406769739776 |
| 54.60000000000131 |  |  |  | 2638296844457290240 |
| 54.63000000000131 |  |  |  | 2701580853835990016 |
| 54.66000000000131 |  |  |  | 2766381931985719808 |
| 54.69000000000131 |  |  |  | 2832736426001889792 |
| 54.72000000000131 |  |  |  | 2900681553339400192 |
| 54.75000000000131 |  |  |  | 2970255422643290112 |
| 54.78000000000132 |  |  |  | 3041497055077729792 |
| 54.81000000000132 |  |  |  | 3114446406165150208 |
| 54.84000000000132 |  |  |  | 3189144388147769856 |
| 54.87000000000132 |  |  |  | 3265632892884199936 |
| 54.90000000000132 |  |  |  | 3343954815293530112 |
| 54.93000000000132 |  |  |  | 3424154077360339968 |
| 54.96000000000132 |  |  |  | 3506275652713840128 |
| 54.99000000000132 |  |  |  | 3590365591794970112 |
| 55.02000000000132 |  |  |  | 3676471047625520128 |
| 55.05000000000133 |  |  |  | 3764640302193449984 |
| 55.08000000000133 |  |  |  | 3854922793469640192 |
| 55.11000000000133 |  |  |  | 3947369143070499840 |
| 55.14000000000133 |  |  |  | 4042031184582459904 |
| 55.17000000000133 |  |  |  | 4138961992563789824 |
| 55.20000000000133 |  |  |  | 4238215912240180224 |
| 55.23000000000133 |  |  |  | 4339848589910539776 |
| 55.26000000000133 |  |  |  | 4443917004079880192 |
| 55.29000000000133 |  |  |  | 4550479497337140224 |
| 55.32000000000134 |  |  |  | 4659595808995069952 |
| 55.35000000000134 |  |  |  | 4771327108510919680 |
| 55.38000000000134 |  |  |  | 4885736029706460160 |
| 55.41000000000134 |  |  |  | 5002886705806279680 |
| 55.44000000000134 |  |  |  | 5122844805314259968 |
| 55.47000000000134 |  |  |  | 5245677568747660288 |
| 55.50000000000134 |  |  |  | 5371453846250290176 |
| 55.53000000000134 |  |  |  | 5500244136104670208 |
| 55.56000000000134 |  |  |  | 5632120624165489664 |
| 55.59000000000134 |  |  |  | 5767157224235969536 |
| 55.62000000000134 |  |  |  | 5905429619409899520 |
| 55.65000000000135 |  |  |  | 6047015304402190336 |
| 55.68000000000135 |  |  |  | 6191993628891929600 |
| 55.71000000000135 |  |  |  | 6340445841901530112 |
| 55.74000000000135 |  |  |  | 6492455137237629952 |
| 55.77000000000135 |  |  |  | 6648106700018249728 |
| 55.80000000000135 |  |  |  | 6807487754312620032 |
| 55.83000000000136 |  |  |  | 6970687611920270336 |
| 55.86000000000136 |  |  |  | 7137797722316460032 |
| 55.89000000000136 |  |  |  | 7308911723792000000 |
| 55.92000000000136 |  |  |  | 7484125495815579648 |
| 55.95000000000136 |  |  |  | 7663537212648810496 |
| 55.98000000000136 |  |  |  | 7847247398242549760 |
| 56.01000000000136 |  |  |  | 8035358982446319616 |
| 56.04000000000136 |  |  |  | 8227977358561460224 |
| 56.07000000000136 |  |  |  | 8425210442270619648 |
| 56.10000000000137 |  |  |  | 8627168731976139776 |
| 56.13000000000137 |  |  |  | 8833965370580910080 |
| 56.16000000000137 |  |  |  | 9045716208746980352 |
| 56.19000000000137 |  |  |  | 9262539869666019328 |
| 56.22000000000137 |  |  |  | 9484557815378700288 |
| 56.25000000000137 |  |  |  | 9711894414679599104 |
| 56.28000000000137 |  |  |  | 9944677012645740544 |
| 56.31000000000137 |  |  |  | 10183036001827299328 |
| 56.34000000000137 |  |  |  | 10427104895140300800 |
| 56.37000000000138 |  |  |  | 10677020400502300672 |
| 56.40000000000138 |  |  |  | 10932922497252300800 |
| 56.43000000000138 |  |  |  | 11194954514397399040 |
| 56.46000000000138 |  |  |  | 11463263210730399744 |
| 56.49000000000138 |  |  |  | 11737998856862799872 |
| 56.52000000000138 |  |  |  | 12019315319218900992 |
| 56.55000000000138 |  |  |  | 12307370146037200896 |
| 56.58000000000138 |  |  |  | 12602324655429099520 |
| 56.61000000000138 |  |  |  | 12904344025541900288 |
| 56.64000000000139 |  |  |  | 13213597386876801024 |
| 56.67000000000139 |  |  |  | 13530257916814800896 |
| 56.70000000000139 |  |  |  | 13854502936401199104 |
| 56.73000000000139 |  |  |  | 14186514009445199872 |
| 56.7600000000014 |  |  |  | 14526477043986200576 |
| 56.7900000000014 |  |  |  | 14874582396188100608 |
| 56.8200000000014 |  |  |  | 15231024976715200512 |
| 56.85000000000139 |  |  |  | 15596004359651899392 |
| 56.8800000000014 |  |  |  | 15969724894025299968 |
| 56.9100000000014 |  |  |  | 16352395817994500096 |
| 56.9400000000014 |  |  |  | 16744231375768399872 |
| 56.9700000000014 |  |  |  | 17145450937318799360 |
| 57.0000000000014 |  |  |  | 17556279120954300416 |
| 57.0300000000014 |  |  |  | 17976945918825299968 |
| 57.0600000000014 |  |  |  | 18407686825427200000 |
| 57.0900000000014 |  |  |  | 18848742969176600576 |
| 57.1200000000014 |  |  |  | 19300361247130898432 |
| 57.15000000000141 |  |  |  | 19762794462929399808 |
| 57.18000000000141 |  |  |  | 20236301468030201856 |
| 57.21000000000141 |  |  |  | 20721147306323001344 |
| 57.24000000000141 |  |  |  | 21217603362199199744 |
| 57.27000000000141 |  |  |  | 21725947512159399936 |
| 57.30000000000141 |  |  |  | 22246464280045801472 |
| 57.33000000000141 |  |  |  | 22779444995983601664 |
| 57.36000000000141 |  |  |  | 23325187959121399808 |
| 57.39000000000141 |  |  |  | 23883998604261699584 |
| 57.42000000000142 |  |  |  | 24456189672471900160 |
| 57.45000000000142 |  |  |  | 25042081385775300608 |
| 57.48000000000142 |  |  |  | 25642001626014900224 |
| 57.51000000000142 |  |  |  | 26256286117992300544 |
| 57.54000000000142 |  |  |  | 26885278616984199168 |
| 57.57000000000142 |  |  |  | 27529331100738998272 |
| 57.60000000000142 |  |  |  | 28188803966062399488 |
| 57.63000000000142 |  |  |  | 28864066230100099072 |
| 57.66000000000142 |  |  |  | 29555495736432300032 |
| 57.69000000000142 |  |  |  | 30263479366091198464 |
| 57.72000000000142 |  |  |  | 30988413253622697984 |
| 57.75000000000143 |  |  |  | 31730703008310300672 |
| 57.78000000000143 |  |  |  | 32490763940685701120 |
| 57.81000000000143 |  |  |  | 33269021294452801536 |
| 57.84000000000143 |  |  |  | 34065910483952099328 |
| 57.87000000000143 |  |  |  | 34881877337301598208 |
| 57.90000000000143 |  |  |  | 35717378345345798144 |
| 57.93000000000143 |  |  |  | 36572880916554399744 |
| 57.96000000000144 |  |  |  | 37448863638011396096 |
| 57.99000000000144 |  |  |  | 38345816542640398336 |
| 58.02000000000144 |  |  |  | 39264241382815801344 |
| 58.05000000000144 |  |  |  | 40204651910509699072 |
| 58.08000000000144 |  |  |  | 41167574164136001536 |
| 58.11000000000144 |  |  |  | 42153546762244997120 |
| 58.14000000000144 |  |  |  | 43163121204237197312 |
| 58.17000000000144 |  |  |  | 44196862178261499904 |
| 58.20000000000144 |  |  |  | 45255347876470104064 |
| 58.23000000000144 |  |  |  | 46339170317805903872 |
| 58.26000000000144 |  |  |  | 47448935678502404096 |
| 58.29000000000144 |  |  |  | 48585264630477897728 |
| 58.32000000000145 |  |  |  | 49748792687818596352 |
| 58.35000000000145 |  |  |  | 50940170561536303104 |
| 58.38000000000145 |  |  |  | 52160064522802798592 |
| 58.41000000000145 |  |  |  | 53409156774863503360 |
| 58.44000000000145 |  |  |  | 54688145833835003904 |
| 58.47000000000146 |  |  |  | 55997746918601703424 |
| 58.50000000000146 |  |  |  | 57338692350024802304 |
| 58.53000000000146 |  |  |  | 58711731959692599296 |
| 58.56000000000146 |  |  |  | 60117633508432101376 |
| 58.59000000000146 |  |  |  | 61557183114820902912 |
| 58.62000000000146 |  |  |  | 63031185693935296512 |
| 58.65000000000146 |  |  |  | 64540465406579900416 |
| 58.68000000000146 |  |  |  | 66085866119250501632 |
| 58.71000000000146 |  |  |  | 67668251875080699904 |
| 58.74000000000147 |  |  |  | 69288507376045801472 |
| 58.77000000000147 |  |  |  | 70947538476679200768 |
| 58.80000000000147 |  |  |  | 72646272689586601984 |
| 58.83000000000147 |  |  |  | 74385659703034593280 |
| 58.86000000000147 |  |  |  | 76166671910903906304 |
| 58.89000000000147 |  |  |  | 77990304955302297600 |
| 58.92000000000147 |  |  |  | 79857578282136207360 |
| 58.95000000000147 |  |  |  | 81769535709958995968 |
| 58.98000000000147 |  |  |  | 83727246012402302976 |
| 59.01000000000148 |  |  |  | 85731803514520993792 |
| 59.04000000000148 |  |  |  | 87784328703383994368 |
| 59.07000000000148 |  |  |  | 89885968853248802816 |
| 59.10000000000148 |  |  |  | 92037898665669296128 |
| 59.13000000000148 |  |  |  | 94241320924890693632 |
| 59.16000000000148 |  |  |  | 96497467168905003008 |
| 59.19000000000148 |  |  |  | 98807598376527806464 |
| 59.22000000000148 |  |  |  | 101173005670889996288 |
| 59.25000000000149 |  |  |  | 103595011039733006336 |
| 59.28000000000149 |  |  |  | 106074968072902000640 |
| 59.31000000000149 |  |  |  | 108614262717465001984 |
| 59.34000000000149 |  |  |  | 111214314050850996224 |
| 59.37000000000149 |  |  |  | 113876575072473006080 |
| 59.4000000000015 |  |  |  | 116602533514241998848 |
| 59.4300000000015 |  |  |  | 119393712670447992832 |
| 59.4600000000015 |  |  |  | 122251672247454007296 |
| 59.4900000000015 |  |  |  | 125178009233693999104 |
| 59.5200000000015 |  |  |  | 128174358790434996224 |
| 59.5500000000015 |  |  |  | 131242395163828994048 |
| 59.5800000000015 |  |  |  | 134383832618726998016 |
| 59.6100000000015 |  |  |  | 137600426394817003520 |
| 59.6400000000015 |  |  |  | 140893973685579005952 |
| 59.6700000000015 |  |  |  | 144266314640624992256 |
| 59.7000000000015 |  |  |  | 147719333391978987520 |
| 59.7300000000015 |  |  |  | 151254959104859013120 |
| 59.7600000000015 |  |  |  | 154875167053565001728 |
| 59.7900000000015 |  |  |  | 158581979723039997952 |
| 59.82000000000151 |  |  |  | 162377467936762003456 |
| 59.85000000000151 |  |  |  | 166263752011548000256 |
| 59.88000000000151 |  |  |  | 170243002939948990464 |
| 59.91000000000151 |  |  |  | 174317443600872996864 |
| 59.94000000000151 |  |  |  | 178489349999121989632 |
| 59.97000000000151 |  |  |  | 182761052534525001728 |
| 60.00000000000151 |  |  |  | 187134937301376991232 |